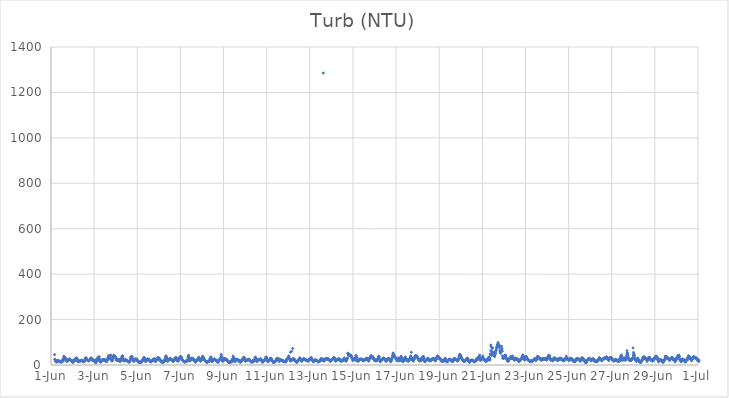
| Category | Turb (NTU) |
|---|---|
| 45078.166666666664 | 45.92 |
| 45078.177083333336 | 25.36 |
| 45078.1875 | 22.28 |
| 45078.197916666664 | 24.57 |
| 45078.208333333336 | 21 |
| 45078.21875 | 15.4 |
| 45078.229166666664 | 14.65 |
| 45078.239583333336 | 13.23 |
| 45078.25 | 13.12 |
| 45078.260416666664 | 14.63 |
| 45078.270833333336 | 14.95 |
| 45078.28125 | 14.61 |
| 45078.291666666664 | 16.44 |
| 45078.302083333336 | 15.64 |
| 45078.3125 | 19.75 |
| 45078.322916666664 | 18.39 |
| 45078.333333333336 | 18.07 |
| 45078.34375 | 18.23 |
| 45078.354166666664 | 17.75 |
| 45078.364583333336 | 17.93 |
| 45078.375 | 17.51 |
| 45078.385416666664 | 15.96 |
| 45078.395833333336 | 16.28 |
| 45078.40625 | 15.74 |
| 45078.416666666664 | 15.92 |
| 45078.427083333336 | 14.31 |
| 45078.4375 | 14.6 |
| 45078.447916666664 | 14.3 |
| 45078.458333333336 | 14.29 |
| 45078.46875 | 13.17 |
| 45078.479166666664 | 13.64 |
| 45078.489583333336 | 13.99 |
| 45078.5 | 13.61 |
| 45078.510416666664 | 15.01 |
| 45078.520833333336 | 15.53 |
| 45078.53125 | 20.23 |
| 45078.541666666664 | 17.02 |
| 45078.552083333336 | 25.13 |
| 45078.5625 | 24.82 |
| 45078.572916666664 | 18.42 |
| 45078.583333333336 | 28.57 |
| 45078.59375 | 38.75 |
| 45078.604166666664 | 30.69 |
| 45078.614583333336 | 33.72 |
| 45078.625 | 34.27 |
| 45078.635416666664 | 32.79 |
| 45078.645833333336 | 31.76 |
| 45078.65625 | 31.31 |
| 45078.666666666664 | 28.81 |
| 45078.677083333336 | 26.71 |
| 45078.6875 | 24.47 |
| 45078.697916666664 | 21.94 |
| 45078.708333333336 | 21.5 |
| 45078.71875 | 18.52 |
| 45078.729166666664 | 15.84 |
| 45078.739583333336 | 23.09 |
| 45078.75 | 18.67 |
| 45078.760416666664 | 18.86 |
| 45078.770833333336 | 18.47 |
| 45078.78125 | 17.57 |
| 45078.791666666664 | 19.25 |
| 45078.802083333336 | 22.15 |
| 45078.8125 | 22.6 |
| 45078.822916666664 | 24.26 |
| 45078.833333333336 | 26.77 |
| 45078.84375 | 26.59 |
| 45078.854166666664 | 25.15 |
| 45078.864583333336 | 24.55 |
| 45078.875 | 23.62 |
| 45078.885416666664 | 22.93 |
| 45078.895833333336 | 22.88 |
| 45078.90625 | 21.23 |
| 45078.916666666664 | 21.32 |
| 45078.927083333336 | 20.01 |
| 45078.9375 | 19.86 |
| 45078.947916666664 | 19.32 |
| 45078.958333333336 | 19.02 |
| 45078.96875 | 19.49 |
| 45078.979166666664 | 17.47 |
| 45078.989583333336 | 13.19 |
| 45079.0 | 12.24 |
| 45079.010416666664 | 11.13 |
| 45079.020833333336 | 14.89 |
| 45079.03125 | 13.81 |
| 45079.041666666664 | 16.24 |
| 45079.052083333336 | 16.71 |
| 45079.0625 | 17.34 |
| 45079.072916666664 | 20.84 |
| 45079.083333333336 | 18.67 |
| 45079.09375 | 23.79 |
| 45079.104166666664 | 26.09 |
| 45079.114583333336 | 24.34 |
| 45079.125 | 26.2 |
| 45079.135416666664 | 23.95 |
| 45079.145833333336 | 20.17 |
| 45079.15625 | 28.8 |
| 45079.166666666664 | 29.65 |
| 45079.177083333336 | 30.25 |
| 45079.1875 | 31.4 |
| 45079.197916666664 | 26.88 |
| 45079.208333333336 | 28.16 |
| 45079.21875 | 23.72 |
| 45079.229166666664 | 21.64 |
| 45079.239583333336 | 16.57 |
| 45079.25 | 14.6 |
| 45079.260416666664 | 14.62 |
| 45079.270833333336 | 14.93 |
| 45079.28125 | 15.76 |
| 45079.291666666664 | 16.23 |
| 45079.302083333336 | 15.79 |
| 45079.3125 | 16.21 |
| 45079.322916666664 | 16.21 |
| 45079.333333333336 | 18.11 |
| 45079.34375 | 17.85 |
| 45079.354166666664 | 18.48 |
| 45079.364583333336 | 18.47 |
| 45079.375 | 18.95 |
| 45079.385416666664 | 20.31 |
| 45079.395833333336 | 19.07 |
| 45079.40625 | 18.91 |
| 45079.416666666664 | 19.46 |
| 45079.427083333336 | 21.25 |
| 45079.4375 | 21.37 |
| 45079.447916666664 | 19.64 |
| 45079.458333333336 | 20.18 |
| 45079.46875 | 19.62 |
| 45079.479166666664 | 17.78 |
| 45079.489583333336 | 15.8 |
| 45079.5 | 14.61 |
| 45079.510416666664 | 14.62 |
| 45079.520833333336 | 15.07 |
| 45079.53125 | 14.79 |
| 45079.541666666664 | 15.48 |
| 45079.552083333336 | 15.75 |
| 45079.5625 | 17.49 |
| 45079.572916666664 | 20.21 |
| 45079.583333333336 | 22.88 |
| 45079.59375 | 30.32 |
| 45079.604166666664 | 26.39 |
| 45079.614583333336 | 26.7 |
| 45079.625 | 32.23 |
| 45079.635416666664 | 27.98 |
| 45079.645833333336 | 26.82 |
| 45079.65625 | 26.56 |
| 45079.666666666664 | 22.85 |
| 45079.677083333336 | 22.76 |
| 45079.6875 | 23.03 |
| 45079.697916666664 | 22.29 |
| 45079.708333333336 | 20.12 |
| 45079.71875 | 18.86 |
| 45079.729166666664 | 19.69 |
| 45079.739583333336 | 17.73 |
| 45079.75 | 19.84 |
| 45079.760416666664 | 18.91 |
| 45079.770833333336 | 20.56 |
| 45079.78125 | 21.21 |
| 45079.791666666664 | 21.92 |
| 45079.802083333336 | 22.75 |
| 45079.8125 | 24.07 |
| 45079.822916666664 | 25.56 |
| 45079.833333333336 | 28.36 |
| 45079.84375 | 29.32 |
| 45079.854166666664 | 31.04 |
| 45079.864583333336 | 31.08 |
| 45079.875 | 25.86 |
| 45079.885416666664 | 25.13 |
| 45079.895833333336 | 22.26 |
| 45079.90625 | 23.39 |
| 45079.916666666664 | 22.83 |
| 45079.927083333336 | 22.66 |
| 45079.9375 | 20.05 |
| 45079.947916666664 | 20.99 |
| 45079.958333333336 | 23.39 |
| 45079.96875 | 19.8 |
| 45079.979166666664 | 19.93 |
| 45079.989583333336 | 19.05 |
| 45080.0 | 18.43 |
| 45080.010416666664 | 18.31 |
| 45080.020833333336 | 17.96 |
| 45080.03125 | 14.26 |
| 45080.041666666664 | 17.46 |
| 45080.052083333336 | 14.63 |
| 45080.0625 | 12.32 |
| 45080.072916666664 | 10.1 |
| 45080.083333333336 | 10.77 |
| 45080.09375 | 19.51 |
| 45080.104166666664 | 23.15 |
| 45080.114583333336 | 23.91 |
| 45080.125 | 27.42 |
| 45080.135416666664 | 20.66 |
| 45080.145833333336 | 21.31 |
| 45080.15625 | 19.14 |
| 45080.166666666664 | 28.66 |
| 45080.177083333336 | 30.06 |
| 45080.1875 | 26.54 |
| 45080.197916666664 | 31.29 |
| 45080.208333333336 | 32.59 |
| 45080.21875 | 35.5 |
| 45080.229166666664 | 36.5 |
| 45080.239583333336 | 30.2 |
| 45080.25 | 24.04 |
| 45080.260416666664 | 22.04 |
| 45080.270833333336 | 17.02 |
| 45080.28125 | 16.66 |
| 45080.291666666664 | 13.56 |
| 45080.302083333336 | 12.36 |
| 45080.3125 | 14.49 |
| 45080.322916666664 | 16.94 |
| 45080.333333333336 | 15.67 |
| 45080.34375 | 16.73 |
| 45080.354166666664 | 18.71 |
| 45080.364583333336 | 18.63 |
| 45080.375 | 21.32 |
| 45080.385416666664 | 23.64 |
| 45080.395833333336 | 21.08 |
| 45080.40625 | 22.82 |
| 45080.416666666664 | 23.3 |
| 45080.427083333336 | 21.32 |
| 45080.4375 | 24.17 |
| 45080.447916666664 | 22.78 |
| 45080.458333333336 | 24.01 |
| 45080.46875 | 22.61 |
| 45080.479166666664 | 23.21 |
| 45080.489583333336 | 23.24 |
| 45080.5 | 22.13 |
| 45080.510416666664 | 19.94 |
| 45080.520833333336 | 20.4 |
| 45080.53125 | 17.2 |
| 45080.541666666664 | 17.31 |
| 45080.552083333336 | 15.77 |
| 45080.5625 | 15.17 |
| 45080.572916666664 | 14.93 |
| 45080.583333333336 | 15.84 |
| 45080.59375 | 18.66 |
| 45080.604166666664 | 21.98 |
| 45080.614583333336 | 21.47 |
| 45080.625 | 26.03 |
| 45080.635416666664 | 27.11 |
| 45080.645833333336 | 32.24 |
| 45080.65625 | 35.81 |
| 45080.666666666664 | 40.18 |
| 45080.677083333336 | 36.61 |
| 45080.6875 | 36.52 |
| 45080.697916666664 | 41.33 |
| 45080.708333333336 | 38.98 |
| 45080.71875 | 40.59 |
| 45080.729166666664 | 37.33 |
| 45080.739583333336 | 33.7 |
| 45080.75 | 29.04 |
| 45080.760416666664 | 26.21 |
| 45080.770833333336 | 30.18 |
| 45080.78125 | 43.48 |
| 45080.791666666664 | 23.07 |
| 45080.802083333336 | 21.36 |
| 45080.8125 | 23.04 |
| 45080.822916666664 | 17.32 |
| 45080.833333333336 | 18.22 |
| 45080.84375 | 19.88 |
| 45080.854166666664 | 20.87 |
| 45080.864583333336 | 25.61 |
| 45080.875 | 32.19 |
| 45080.885416666664 | 38.19 |
| 45080.895833333336 | 37.8 |
| 45080.90625 | 40.72 |
| 45080.916666666664 | 41.71 |
| 45080.927083333336 | 41.16 |
| 45080.9375 | 39.44 |
| 45080.947916666664 | 38.51 |
| 45080.958333333336 | 38.41 |
| 45080.96875 | 35.86 |
| 45080.979166666664 | 34.79 |
| 45080.989583333336 | 34.67 |
| 45081.0 | 31.75 |
| 45081.010416666664 | 30.57 |
| 45081.020833333336 | 27.59 |
| 45081.03125 | 25.03 |
| 45081.041666666664 | 22.01 |
| 45081.052083333336 | 19.84 |
| 45081.0625 | 19.67 |
| 45081.072916666664 | 21.35 |
| 45081.083333333336 | 24.52 |
| 45081.09375 | 22.98 |
| 45081.104166666664 | 21.73 |
| 45081.114583333336 | 22.16 |
| 45081.125 | 20.98 |
| 45081.135416666664 | 20.81 |
| 45081.145833333336 | 19.48 |
| 45081.15625 | 19.38 |
| 45081.166666666664 | 18.02 |
| 45081.177083333336 | 16.49 |
| 45081.1875 | 15.66 |
| 45081.197916666664 | 23.44 |
| 45081.208333333336 | 27.03 |
| 45081.21875 | 24.31 |
| 45081.229166666664 | 24.36 |
| 45081.239583333336 | 17.06 |
| 45081.25 | 27.96 |
| 45081.260416666664 | 24.69 |
| 45081.270833333336 | 22.03 |
| 45081.28125 | 25.79 |
| 45081.291666666664 | 36.8 |
| 45081.302083333336 | 37.72 |
| 45081.3125 | 40.36 |
| 45081.322916666664 | 39.9 |
| 45081.333333333336 | 34.19 |
| 45081.34375 | 27.15 |
| 45081.354166666664 | 24.2 |
| 45081.364583333336 | 20.72 |
| 45081.375 | 18.28 |
| 45081.385416666664 | 18.06 |
| 45081.395833333336 | 19.02 |
| 45081.40625 | 18.68 |
| 45081.416666666664 | 21.26 |
| 45081.427083333336 | 22.22 |
| 45081.4375 | 22.59 |
| 45081.447916666664 | 21.22 |
| 45081.458333333336 | 22.88 |
| 45081.46875 | 22.24 |
| 45081.479166666664 | 21.46 |
| 45081.489583333336 | 21.62 |
| 45081.5 | 19.3 |
| 45081.510416666664 | 19.09 |
| 45081.520833333336 | 19.72 |
| 45081.53125 | 19.68 |
| 45081.541666666664 | 18.55 |
| 45081.552083333336 | 17.98 |
| 45081.5625 | 15.78 |
| 45081.572916666664 | 14.61 |
| 45081.583333333336 | 14.94 |
| 45081.59375 | 14.77 |
| 45081.604166666664 | 14.74 |
| 45081.614583333336 | 13.09 |
| 45081.625 | 12.27 |
| 45081.635416666664 | 14.32 |
| 45081.645833333336 | 19.14 |
| 45081.65625 | 17.9 |
| 45081.666666666664 | 17.14 |
| 45081.677083333336 | 23.47 |
| 45081.6875 | 33.84 |
| 45081.697916666664 | 27.38 |
| 45081.708333333336 | 36.05 |
| 45081.71875 | 32.59 |
| 45081.729166666664 | 29.96 |
| 45081.739583333336 | 37.29 |
| 45081.75 | 37.15 |
| 45081.760416666664 | 34.53 |
| 45081.770833333336 | 30.5 |
| 45081.78125 | 28.59 |
| 45081.791666666664 | 25.18 |
| 45081.802083333336 | 18.37 |
| 45081.8125 | 18.84 |
| 45081.822916666664 | 18.52 |
| 45081.833333333336 | 17.09 |
| 45081.84375 | 15.92 |
| 45081.854166666664 | 18.11 |
| 45081.864583333336 | 19.88 |
| 45081.875 | 22.93 |
| 45081.885416666664 | 21.27 |
| 45081.895833333336 | 24.49 |
| 45081.90625 | 24.25 |
| 45081.916666666664 | 26.84 |
| 45081.927083333336 | 26.17 |
| 45081.9375 | 24.86 |
| 45081.947916666664 | 24.62 |
| 45081.958333333336 | 26.17 |
| 45081.96875 | 25.26 |
| 45081.979166666664 | 21.82 |
| 45081.989583333336 | 22.71 |
| 45082.0 | 21.95 |
| 45082.010416666664 | 19.56 |
| 45082.020833333336 | 19.51 |
| 45082.03125 | 16.52 |
| 45082.041666666664 | 15.99 |
| 45082.052083333336 | 15.04 |
| 45082.0625 | 14.13 |
| 45082.072916666664 | 13.77 |
| 45082.083333333336 | 13.1 |
| 45082.09375 | 12.25 |
| 45082.104166666664 | 11.05 |
| 45082.114583333336 | 11.92 |
| 45082.125 | 11.55 |
| 45082.135416666664 | 11.05 |
| 45082.145833333336 | 10.77 |
| 45082.15625 | 11.22 |
| 45082.166666666664 | 13.2 |
| 45082.177083333336 | 12.93 |
| 45082.1875 | 13.64 |
| 45082.197916666664 | 16.4 |
| 45082.208333333336 | 14.89 |
| 45082.21875 | 18.95 |
| 45082.229166666664 | 15.63 |
| 45082.239583333336 | 17.85 |
| 45082.25 | 21.09 |
| 45082.260416666664 | 23.42 |
| 45082.270833333336 | 26.81 |
| 45082.28125 | 28.07 |
| 45082.291666666664 | 26.38 |
| 45082.302083333336 | 31.04 |
| 45082.3125 | 33.1 |
| 45082.322916666664 | 29.79 |
| 45082.333333333336 | 31.06 |
| 45082.34375 | 26.65 |
| 45082.354166666664 | 22.91 |
| 45082.364583333336 | 19.53 |
| 45082.375 | 15.48 |
| 45082.385416666664 | 16.03 |
| 45082.395833333336 | 17.32 |
| 45082.40625 | 17.9 |
| 45082.416666666664 | 19.14 |
| 45082.427083333336 | 18.99 |
| 45082.4375 | 20.67 |
| 45082.447916666664 | 23.56 |
| 45082.458333333336 | 25.72 |
| 45082.46875 | 24.94 |
| 45082.479166666664 | 25.5 |
| 45082.489583333336 | 25.2 |
| 45082.5 | 25.49 |
| 45082.510416666664 | 22.78 |
| 45082.520833333336 | 24.58 |
| 45082.53125 | 24.31 |
| 45082.541666666664 | 26.2 |
| 45082.552083333336 | 20.39 |
| 45082.5625 | 20.92 |
| 45082.572916666664 | 18.24 |
| 45082.583333333336 | 16.61 |
| 45082.59375 | 17.28 |
| 45082.604166666664 | 14.89 |
| 45082.614583333336 | 15.22 |
| 45082.625 | 15.23 |
| 45082.635416666664 | 13.04 |
| 45082.645833333336 | 14.44 |
| 45082.65625 | 17.63 |
| 45082.666666666664 | 17.74 |
| 45082.677083333336 | 18.18 |
| 45082.6875 | 19.62 |
| 45082.697916666664 | 21.12 |
| 45082.708333333336 | 20.81 |
| 45082.71875 | 20.01 |
| 45082.729166666664 | 19.48 |
| 45082.739583333336 | 23.4 |
| 45082.75 | 23.07 |
| 45082.760416666664 | 24.92 |
| 45082.770833333336 | 26.02 |
| 45082.78125 | 27.28 |
| 45082.791666666664 | 26.86 |
| 45082.802083333336 | 26.06 |
| 45082.8125 | 22.96 |
| 45082.822916666664 | 21.44 |
| 45082.833333333336 | 18.45 |
| 45082.84375 | 16.69 |
| 45082.854166666664 | 14.66 |
| 45082.864583333336 | 18.68 |
| 45082.875 | 19.77 |
| 45082.885416666664 | 22.4 |
| 45082.895833333336 | 21.09 |
| 45082.90625 | 21.84 |
| 45082.916666666664 | 24.81 |
| 45082.927083333336 | 28.85 |
| 45082.9375 | 30.22 |
| 45082.947916666664 | 31.08 |
| 45082.958333333336 | 31.94 |
| 45082.96875 | 32.38 |
| 45082.979166666664 | 30.52 |
| 45082.989583333336 | 31.37 |
| 45083.0 | 29.77 |
| 45083.010416666664 | 30.36 |
| 45083.020833333336 | 26.24 |
| 45083.03125 | 26.25 |
| 45083.041666666664 | 23.23 |
| 45083.052083333336 | 20.88 |
| 45083.0625 | 21.01 |
| 45083.072916666664 | 20.85 |
| 45083.083333333336 | 17.7 |
| 45083.09375 | 18.52 |
| 45083.104166666664 | 16.6 |
| 45083.114583333336 | 16.27 |
| 45083.125 | 15.85 |
| 45083.135416666664 | 13.53 |
| 45083.145833333336 | 12.04 |
| 45083.15625 | 11.56 |
| 45083.166666666664 | 12.38 |
| 45083.177083333336 | 13.33 |
| 45083.1875 | 12.4 |
| 45083.197916666664 | 14.03 |
| 45083.208333333336 | 12.22 |
| 45083.21875 | 12.71 |
| 45083.229166666664 | 16.11 |
| 45083.239583333336 | 19.94 |
| 45083.25 | 18.74 |
| 45083.260416666664 | 23.87 |
| 45083.270833333336 | 19.35 |
| 45083.28125 | 20.6 |
| 45083.291666666664 | 17.88 |
| 45083.302083333336 | 18.5 |
| 45083.3125 | 33.6 |
| 45083.322916666664 | 37 |
| 45083.333333333336 | 40.64 |
| 45083.34375 | 35.44 |
| 45083.354166666664 | 34.06 |
| 45083.364583333336 | 30.74 |
| 45083.375 | 27.79 |
| 45083.385416666664 | 22.51 |
| 45083.395833333336 | 21 |
| 45083.40625 | 16.99 |
| 45083.416666666664 | 16.47 |
| 45083.427083333336 | 18.76 |
| 45083.4375 | 18.98 |
| 45083.447916666664 | 20.31 |
| 45083.458333333336 | 22.65 |
| 45083.46875 | 23.47 |
| 45083.479166666664 | 25.93 |
| 45083.489583333336 | 26.48 |
| 45083.5 | 26.63 |
| 45083.510416666664 | 28.49 |
| 45083.520833333336 | 29.04 |
| 45083.53125 | 27.48 |
| 45083.541666666664 | 26.77 |
| 45083.552083333336 | 26.24 |
| 45083.5625 | 26.74 |
| 45083.572916666664 | 25.39 |
| 45083.583333333336 | 22.41 |
| 45083.59375 | 23 |
| 45083.604166666664 | 22.22 |
| 45083.614583333336 | 19.57 |
| 45083.625 | 20.16 |
| 45083.635416666664 | 18.48 |
| 45083.645833333336 | 17.41 |
| 45083.65625 | 15.37 |
| 45083.666666666664 | 17.37 |
| 45083.677083333336 | 16.09 |
| 45083.6875 | 17.86 |
| 45083.697916666664 | 19.58 |
| 45083.708333333336 | 21.8 |
| 45083.71875 | 26.32 |
| 45083.729166666664 | 23.18 |
| 45083.739583333336 | 22.02 |
| 45083.75 | 28.94 |
| 45083.760416666664 | 31.54 |
| 45083.770833333336 | 30.53 |
| 45083.78125 | 30.13 |
| 45083.791666666664 | 30.72 |
| 45083.802083333336 | 32.23 |
| 45083.8125 | 31.04 |
| 45083.822916666664 | 27.76 |
| 45083.833333333336 | 26 |
| 45083.84375 | 25.32 |
| 45083.854166666664 | 19.79 |
| 45083.864583333336 | 22.5 |
| 45083.875 | 17.01 |
| 45083.885416666664 | 17.35 |
| 45083.895833333336 | 18.45 |
| 45083.90625 | 22.41 |
| 45083.916666666664 | 23.42 |
| 45083.927083333336 | 22.47 |
| 45083.9375 | 25.14 |
| 45083.947916666664 | 29.31 |
| 45083.958333333336 | 29.41 |
| 45083.96875 | 31.66 |
| 45083.979166666664 | 32.54 |
| 45083.989583333336 | 36.06 |
| 45084.0 | 37.14 |
| 45084.010416666664 | 34.3 |
| 45084.020833333336 | 35 |
| 45084.03125 | 35.93 |
| 45084.041666666664 | 33.61 |
| 45084.052083333336 | 30.47 |
| 45084.0625 | 27.24 |
| 45084.072916666664 | 24.83 |
| 45084.083333333336 | 22.06 |
| 45084.09375 | 21.86 |
| 45084.104166666664 | 21.75 |
| 45084.114583333336 | 20.35 |
| 45084.125 | 18.97 |
| 45084.135416666664 | 17.61 |
| 45084.145833333336 | 15.77 |
| 45084.15625 | 15.49 |
| 45084.166666666664 | 15.92 |
| 45084.177083333336 | 13.27 |
| 45084.1875 | 12.9 |
| 45084.197916666664 | 14.42 |
| 45084.208333333336 | 13.62 |
| 45084.21875 | 14.39 |
| 45084.229166666664 | 14.7 |
| 45084.239583333336 | 14.81 |
| 45084.25 | 15.43 |
| 45084.260416666664 | 16.06 |
| 45084.270833333336 | 17.36 |
| 45084.28125 | 20.14 |
| 45084.291666666664 | 17.86 |
| 45084.302083333336 | 20.99 |
| 45084.3125 | 20.41 |
| 45084.322916666664 | 16.26 |
| 45084.333333333336 | 20.37 |
| 45084.34375 | 22.27 |
| 45084.354166666664 | 34.55 |
| 45084.364583333336 | 33.54 |
| 45084.375 | 38.19 |
| 45084.385416666664 | 43.47 |
| 45084.395833333336 | 33.68 |
| 45084.40625 | 27.45 |
| 45084.416666666664 | 21.1 |
| 45084.427083333336 | 20.12 |
| 45084.4375 | 17.59 |
| 45084.447916666664 | 18.75 |
| 45084.458333333336 | 20.71 |
| 45084.46875 | 22.54 |
| 45084.479166666664 | 25.39 |
| 45084.489583333336 | 22.5 |
| 45084.5 | 25.08 |
| 45084.510416666664 | 28.29 |
| 45084.520833333336 | 30.13 |
| 45084.53125 | 25.57 |
| 45084.541666666664 | 30.13 |
| 45084.552083333336 | 29.17 |
| 45084.5625 | 28.09 |
| 45084.572916666664 | 25.64 |
| 45084.583333333336 | 25.84 |
| 45084.59375 | 26.21 |
| 45084.604166666664 | 25.93 |
| 45084.614583333336 | 22.85 |
| 45084.625 | 23.94 |
| 45084.635416666664 | 22.51 |
| 45084.645833333336 | 20.04 |
| 45084.65625 | 20.17 |
| 45084.666666666664 | 16.43 |
| 45084.677083333336 | 14.09 |
| 45084.6875 | 15.07 |
| 45084.697916666664 | 13.8 |
| 45084.708333333336 | 12.75 |
| 45084.71875 | 17.18 |
| 45084.729166666664 | 19.54 |
| 45084.739583333336 | 19.41 |
| 45084.75 | 20.06 |
| 45084.760416666664 | 20.45 |
| 45084.770833333336 | 22.24 |
| 45084.78125 | 23.07 |
| 45084.791666666664 | 21.43 |
| 45084.802083333336 | 22.86 |
| 45084.8125 | 22.61 |
| 45084.822916666664 | 29.21 |
| 45084.833333333336 | 26.89 |
| 45084.84375 | 34.19 |
| 45084.854166666664 | 32.17 |
| 45084.864583333336 | 30.64 |
| 45084.875 | 30.83 |
| 45084.885416666664 | 28.09 |
| 45084.895833333336 | 23.15 |
| 45084.90625 | 20.91 |
| 45084.916666666664 | 22.8 |
| 45084.927083333336 | 17.19 |
| 45084.9375 | 16.67 |
| 45084.947916666664 | 20.37 |
| 45084.958333333336 | 20.2 |
| 45084.96875 | 21.59 |
| 45084.979166666664 | 24.29 |
| 45084.989583333336 | 25.19 |
| 45085.0 | 25.87 |
| 45085.010416666664 | 31.42 |
| 45085.020833333336 | 33.42 |
| 45085.03125 | 38.32 |
| 45085.041666666664 | 34.33 |
| 45085.052083333336 | 35.91 |
| 45085.0625 | 32.39 |
| 45085.072916666664 | 30.31 |
| 45085.083333333336 | 30.86 |
| 45085.09375 | 29.34 |
| 45085.104166666664 | 24.01 |
| 45085.114583333336 | 22.82 |
| 45085.125 | 21.92 |
| 45085.135416666664 | 20.24 |
| 45085.145833333336 | 18.79 |
| 45085.15625 | 18.67 |
| 45085.166666666664 | 17.39 |
| 45085.177083333336 | 16.56 |
| 45085.1875 | 16.3 |
| 45085.197916666664 | 13.47 |
| 45085.208333333336 | 12.09 |
| 45085.21875 | 12.29 |
| 45085.229166666664 | 12.98 |
| 45085.239583333336 | 12.51 |
| 45085.25 | 13.99 |
| 45085.260416666664 | 14.11 |
| 45085.270833333336 | 13.65 |
| 45085.28125 | 14.67 |
| 45085.291666666664 | 15.13 |
| 45085.302083333336 | 16.03 |
| 45085.3125 | 16.72 |
| 45085.322916666664 | 17.02 |
| 45085.333333333336 | 17.67 |
| 45085.34375 | 17.44 |
| 45085.354166666664 | 16.41 |
| 45085.364583333336 | 21.54 |
| 45085.375 | 27.13 |
| 45085.385416666664 | 28.9 |
| 45085.395833333336 | 25.42 |
| 45085.40625 | 32.86 |
| 45085.416666666664 | 36.03 |
| 45085.427083333336 | 29.19 |
| 45085.4375 | 27.18 |
| 45085.447916666664 | 24.71 |
| 45085.458333333336 | 18.47 |
| 45085.46875 | 14.37 |
| 45085.479166666664 | 16.13 |
| 45085.489583333336 | 17.86 |
| 45085.5 | 19.37 |
| 45085.510416666664 | 18.61 |
| 45085.520833333336 | 23.14 |
| 45085.53125 | 23.65 |
| 45085.541666666664 | 24.43 |
| 45085.552083333336 | 24.42 |
| 45085.5625 | 26.83 |
| 45085.572916666664 | 24.7 |
| 45085.583333333336 | 25.57 |
| 45085.59375 | 25.27 |
| 45085.604166666664 | 24.29 |
| 45085.614583333336 | 22.24 |
| 45085.625 | 24.04 |
| 45085.635416666664 | 21.29 |
| 45085.645833333336 | 19.68 |
| 45085.65625 | 21.56 |
| 45085.666666666664 | 20.34 |
| 45085.677083333336 | 20.13 |
| 45085.6875 | 17.13 |
| 45085.697916666664 | 15.85 |
| 45085.708333333336 | 15.68 |
| 45085.71875 | 13.27 |
| 45085.729166666664 | 12.59 |
| 45085.739583333336 | 12.94 |
| 45085.75 | 12.83 |
| 45085.760416666664 | 18.63 |
| 45085.770833333336 | 21.14 |
| 45085.78125 | 20.62 |
| 45085.791666666664 | 21.59 |
| 45085.802083333336 | 21.06 |
| 45085.8125 | 21.29 |
| 45085.822916666664 | 22.54 |
| 45085.833333333336 | 23.35 |
| 45085.84375 | 26.61 |
| 45085.854166666664 | 27.92 |
| 45085.864583333336 | 31.62 |
| 45085.875 | 31.77 |
| 45085.885416666664 | 40.56 |
| 45085.895833333336 | 46.65 |
| 45085.90625 | 36.34 |
| 45085.916666666664 | 33.46 |
| 45085.927083333336 | 33.7 |
| 45085.9375 | 25.57 |
| 45085.947916666664 | 21.31 |
| 45085.958333333336 | 15.89 |
| 45085.96875 | 17.15 |
| 45085.979166666664 | 20.54 |
| 45085.989583333336 | 23.06 |
| 45086.0 | 23.84 |
| 45086.010416666664 | 24.88 |
| 45086.020833333336 | 21.26 |
| 45086.03125 | 28.57 |
| 45086.041666666664 | 23.95 |
| 45086.052083333336 | 25.02 |
| 45086.0625 | 27.61 |
| 45086.072916666664 | 26.21 |
| 45086.083333333336 | 27.33 |
| 45086.09375 | 25.18 |
| 45086.104166666664 | 23.99 |
| 45086.114583333336 | 23.07 |
| 45086.125 | 22.69 |
| 45086.135416666664 | 25.6 |
| 45086.145833333336 | 21.27 |
| 45086.15625 | 21.35 |
| 45086.166666666664 | 22.19 |
| 45086.177083333336 | 19.6 |
| 45086.1875 | 18.51 |
| 45086.197916666664 | 16.77 |
| 45086.208333333336 | 15.5 |
| 45086.21875 | 14.86 |
| 45086.229166666664 | 13.06 |
| 45086.239583333336 | 13.3 |
| 45086.25 | 12.19 |
| 45086.260416666664 | 12.66 |
| 45086.270833333336 | 12.48 |
| 45086.28125 | 12.29 |
| 45086.291666666664 | 12.75 |
| 45086.302083333336 | 12.56 |
| 45086.3125 | 12.9 |
| 45086.322916666664 | 12.9 |
| 45086.333333333336 | 14.72 |
| 45086.34375 | 13.4 |
| 45086.354166666664 | 16.83 |
| 45086.364583333336 | 14.34 |
| 45086.375 | 14.87 |
| 45086.385416666664 | 21.84 |
| 45086.395833333336 | 16.86 |
| 45086.40625 | 26.19 |
| 45086.416666666664 | 25.35 |
| 45086.427083333336 | 17.49 |
| 45086.4375 | 39.67 |
| 45086.447916666664 | 25.89 |
| 45086.458333333336 | 35.29 |
| 45086.46875 | 31.16 |
| 45086.479166666664 | 25.44 |
| 45086.489583333336 | 21.96 |
| 45086.5 | 16.54 |
| 45086.510416666664 | 15.5 |
| 45086.520833333336 | 15.16 |
| 45086.53125 | 19.53 |
| 45086.541666666664 | 20.11 |
| 45086.552083333336 | 18.26 |
| 45086.5625 | 20.22 |
| 45086.572916666664 | 26.47 |
| 45086.583333333336 | 21.79 |
| 45086.59375 | 22.45 |
| 45086.604166666664 | 23.74 |
| 45086.614583333336 | 22.92 |
| 45086.625 | 22.32 |
| 45086.635416666664 | 24.75 |
| 45086.645833333336 | 23.56 |
| 45086.65625 | 21.33 |
| 45086.666666666664 | 21.59 |
| 45086.677083333336 | 22.41 |
| 45086.6875 | 22.16 |
| 45086.697916666664 | 20.8 |
| 45086.708333333336 | 20.72 |
| 45086.71875 | 20.57 |
| 45086.729166666664 | 18.68 |
| 45086.739583333336 | 17.81 |
| 45086.75 | 14.03 |
| 45086.760416666664 | 13.97 |
| 45086.770833333336 | 12.66 |
| 45086.78125 | 14.05 |
| 45086.791666666664 | 13.82 |
| 45086.802083333336 | 15.32 |
| 45086.8125 | 16.38 |
| 45086.822916666664 | 19.48 |
| 45086.833333333336 | 19.77 |
| 45086.84375 | 20.81 |
| 45086.854166666664 | 21.91 |
| 45086.864583333336 | 20.7 |
| 45086.875 | 24.3 |
| 45086.885416666664 | 24.55 |
| 45086.895833333336 | 24.86 |
| 45086.90625 | 31.39 |
| 45086.916666666664 | 30.62 |
| 45086.927083333336 | 30.98 |
| 45086.9375 | 34 |
| 45086.947916666664 | 32.02 |
| 45086.958333333336 | 29.45 |
| 45086.96875 | 30.57 |
| 45086.979166666664 | 22.06 |
| 45086.989583333336 | 20.99 |
| 45087.0 | 17.64 |
| 45087.010416666664 | 17.2 |
| 45087.020833333336 | 17.44 |
| 45087.03125 | 18.87 |
| 45087.041666666664 | 19.49 |
| 45087.052083333336 | 19.59 |
| 45087.0625 | 20.01 |
| 45087.072916666664 | 19.57 |
| 45087.083333333336 | 22.76 |
| 45087.09375 | 19.46 |
| 45087.104166666664 | 22.38 |
| 45087.114583333336 | 23.08 |
| 45087.125 | 22.43 |
| 45087.135416666664 | 22.81 |
| 45087.145833333336 | 23.47 |
| 45087.15625 | 23.55 |
| 45087.166666666664 | 21.65 |
| 45087.177083333336 | 23.9 |
| 45087.1875 | 26.45 |
| 45087.197916666664 | 21.62 |
| 45087.208333333336 | 21.34 |
| 45087.21875 | 20.79 |
| 45087.229166666664 | 20.23 |
| 45087.239583333336 | 19.04 |
| 45087.25 | 18.27 |
| 45087.260416666664 | 15.29 |
| 45087.270833333336 | 15.17 |
| 45087.28125 | 14.38 |
| 45087.291666666664 | 12.48 |
| 45087.302083333336 | 12.19 |
| 45087.3125 | 13.11 |
| 45087.322916666664 | 13.34 |
| 45087.333333333336 | 16.4 |
| 45087.34375 | 14.35 |
| 45087.354166666664 | 18.39 |
| 45087.364583333336 | 16.61 |
| 45087.375 | 15.27 |
| 45087.385416666664 | 16.81 |
| 45087.395833333336 | 20.47 |
| 45087.40625 | 20.95 |
| 45087.416666666664 | 21.46 |
| 45087.427083333336 | 16.6 |
| 45087.4375 | 23.36 |
| 45087.447916666664 | 23.97 |
| 45087.458333333336 | 29.56 |
| 45087.46875 | 31.81 |
| 45087.479166666664 | 34.86 |
| 45087.489583333336 | 30.58 |
| 45087.5 | 28.01 |
| 45087.510416666664 | 24.36 |
| 45087.520833333336 | 22.69 |
| 45087.53125 | 17.9 |
| 45087.541666666664 | 15.37 |
| 45087.552083333336 | 16.36 |
| 45087.5625 | 18.59 |
| 45087.572916666664 | 21.57 |
| 45087.583333333336 | 19.29 |
| 45087.59375 | 21.24 |
| 45087.604166666664 | 21.4 |
| 45087.614583333336 | 24.32 |
| 45087.625 | 24.19 |
| 45087.635416666664 | 23.14 |
| 45087.645833333336 | 24.13 |
| 45087.65625 | 24.24 |
| 45087.666666666664 | 23.63 |
| 45087.677083333336 | 23 |
| 45087.6875 | 23.82 |
| 45087.697916666664 | 24.41 |
| 45087.708333333336 | 27.21 |
| 45087.71875 | 27.55 |
| 45087.729166666664 | 26.03 |
| 45087.739583333336 | 24.06 |
| 45087.75 | 19.86 |
| 45087.760416666664 | 22.16 |
| 45087.770833333336 | 19.92 |
| 45087.78125 | 19.64 |
| 45087.791666666664 | 14.29 |
| 45087.802083333336 | 13.65 |
| 45087.8125 | 12.43 |
| 45087.822916666664 | 14.49 |
| 45087.833333333336 | 13.18 |
| 45087.84375 | 16.26 |
| 45087.854166666664 | 17.83 |
| 45087.864583333336 | 17.94 |
| 45087.875 | 20.15 |
| 45087.885416666664 | 19.35 |
| 45087.895833333336 | 21.18 |
| 45087.90625 | 21.75 |
| 45087.916666666664 | 22.57 |
| 45087.927083333336 | 22.16 |
| 45087.9375 | 23.94 |
| 45087.947916666664 | 26.92 |
| 45087.958333333336 | 33.09 |
| 45087.96875 | 35.14 |
| 45087.979166666664 | 34.25 |
| 45087.989583333336 | 33.18 |
| 45088.0 | 28.05 |
| 45088.010416666664 | 26.3 |
| 45088.020833333336 | 22.2 |
| 45088.03125 | 20.91 |
| 45088.041666666664 | 17.42 |
| 45088.052083333336 | 16.23 |
| 45088.0625 | 15.38 |
| 45088.072916666664 | 16.47 |
| 45088.083333333336 | 16.98 |
| 45088.09375 | 18.07 |
| 45088.104166666664 | 19.95 |
| 45088.114583333336 | 19.02 |
| 45088.125 | 20.32 |
| 45088.135416666664 | 21.65 |
| 45088.145833333336 | 21.62 |
| 45088.15625 | 25.91 |
| 45088.166666666664 | 27.28 |
| 45088.177083333336 | 30.07 |
| 45088.1875 | 27.86 |
| 45088.197916666664 | 28.17 |
| 45088.208333333336 | 26.34 |
| 45088.21875 | 27.66 |
| 45088.229166666664 | 22.15 |
| 45088.239583333336 | 22.6 |
| 45088.25 | 18.48 |
| 45088.260416666664 | 18.88 |
| 45088.270833333336 | 17.63 |
| 45088.28125 | 15.96 |
| 45088.291666666664 | 14.39 |
| 45088.302083333336 | 13.55 |
| 45088.3125 | 10.43 |
| 45088.322916666664 | 11.95 |
| 45088.333333333336 | 12.88 |
| 45088.34375 | 13.77 |
| 45088.354166666664 | 13.96 |
| 45088.364583333336 | 14.13 |
| 45088.375 | 13.89 |
| 45088.385416666664 | 14.06 |
| 45088.395833333336 | 18.1 |
| 45088.40625 | 16.06 |
| 45088.416666666664 | 19.09 |
| 45088.427083333336 | 17.97 |
| 45088.4375 | 20.43 |
| 45088.447916666664 | 25.26 |
| 45088.458333333336 | 19.99 |
| 45088.46875 | 26.6 |
| 45088.479166666664 | 28.78 |
| 45088.489583333336 | 29.85 |
| 45088.5 | 27.28 |
| 45088.510416666664 | 28.63 |
| 45088.520833333336 | 26.34 |
| 45088.53125 | 23.97 |
| 45088.541666666664 | 22.17 |
| 45088.552083333336 | 20.29 |
| 45088.5625 | 19.45 |
| 45088.572916666664 | 17.3 |
| 45088.583333333336 | 15.96 |
| 45088.59375 | 25.81 |
| 45088.604166666664 | 24.97 |
| 45088.614583333336 | 23.04 |
| 45088.625 | 22.09 |
| 45088.635416666664 | 21.31 |
| 45088.645833333336 | 19.6 |
| 45088.65625 | 21.39 |
| 45088.666666666664 | 20.58 |
| 45088.677083333336 | 20.51 |
| 45088.6875 | 20.96 |
| 45088.697916666664 | 22.36 |
| 45088.708333333336 | 19.49 |
| 45088.71875 | 20.44 |
| 45088.729166666664 | 18.35 |
| 45088.739583333336 | 18.35 |
| 45088.75 | 16.62 |
| 45088.760416666664 | 16.95 |
| 45088.770833333336 | 17.39 |
| 45088.78125 | 17.21 |
| 45088.791666666664 | 17.06 |
| 45088.802083333336 | 17.1 |
| 45088.8125 | 15.13 |
| 45088.822916666664 | 15.95 |
| 45088.833333333336 | 15.19 |
| 45088.84375 | 14.43 |
| 45088.854166666664 | 13.91 |
| 45088.864583333336 | 13.15 |
| 45088.875 | 18.5 |
| 45088.885416666664 | 14.25 |
| 45088.895833333336 | 15.01 |
| 45088.90625 | 19.27 |
| 45088.916666666664 | 19.55 |
| 45088.927083333336 | 20.82 |
| 45088.9375 | 27.19 |
| 45088.947916666664 | 24.84 |
| 45088.958333333336 | 26.85 |
| 45088.96875 | 27.44 |
| 45088.979166666664 | 28.42 |
| 45088.989583333336 | 29.93 |
| 45089.0 | 32.58 |
| 45089.010416666664 | 30.54 |
| 45089.020833333336 | 39.92 |
| 45089.03125 | 36.35 |
| 45089.041666666664 | 29.15 |
| 45089.052083333336 | 30.96 |
| 45089.0625 | 25.63 |
| 45089.072916666664 | 25 |
| 45089.083333333336 | 18.92 |
| 45089.09375 | 18.56 |
| 45089.104166666664 | 55.66 |
| 45089.114583333336 | 17.48 |
| 45089.125 | 20.79 |
| 45089.135416666664 | 19.39 |
| 45089.145833333336 | 20.11 |
| 45089.15625 | 60.22 |
| 45089.166666666664 | 20.16 |
| 45089.177083333336 | 23.49 |
| 45089.1875 | 24.52 |
| 45089.197916666664 | 26.24 |
| 45089.208333333336 | 72.9 |
| 45089.21875 | 26.84 |
| 45089.229166666664 | 25.76 |
| 45089.239583333336 | 29.13 |
| 45089.25 | 23.9 |
| 45089.260416666664 | 22.61 |
| 45089.270833333336 | 22.89 |
| 45089.28125 | 25.07 |
| 45089.291666666664 | 24.71 |
| 45089.302083333336 | 21.26 |
| 45089.3125 | 21.22 |
| 45089.322916666664 | 21.03 |
| 45089.333333333336 | 17.21 |
| 45089.34375 | 16.33 |
| 45089.354166666664 | 14.88 |
| 45089.364583333336 | 12.46 |
| 45089.375 | 14.89 |
| 45089.385416666664 | 14.22 |
| 45089.395833333336 | 14.13 |
| 45089.40625 | 12.59 |
| 45089.416666666664 | 12.87 |
| 45089.427083333336 | 16.06 |
| 45089.4375 | 19.45 |
| 45089.447916666664 | 19.45 |
| 45089.458333333336 | 19.15 |
| 45089.46875 | 20.08 |
| 45089.479166666664 | 20.73 |
| 45089.489583333336 | 22.67 |
| 45089.5 | 25.88 |
| 45089.510416666664 | 24.11 |
| 45089.520833333336 | 27.43 |
| 45089.53125 | 30.52 |
| 45089.541666666664 | 31.28 |
| 45089.552083333336 | 26.12 |
| 45089.5625 | 23.42 |
| 45089.572916666664 | 23.18 |
| 45089.583333333336 | 20.03 |
| 45089.59375 | 18.75 |
| 45089.604166666664 | 18.07 |
| 45089.614583333336 | 16.26 |
| 45089.625 | 15.97 |
| 45089.635416666664 | 23.08 |
| 45089.645833333336 | 23.86 |
| 45089.65625 | 21.27 |
| 45089.666666666664 | 20.85 |
| 45089.677083333336 | 24.79 |
| 45089.6875 | 24.26 |
| 45089.697916666664 | 27.2 |
| 45089.708333333336 | 26.37 |
| 45089.71875 | 26.04 |
| 45089.729166666664 | 26.04 |
| 45089.739583333336 | 27.67 |
| 45089.75 | 24.54 |
| 45089.760416666664 | 23.92 |
| 45089.770833333336 | 23.75 |
| 45089.78125 | 23.1 |
| 45089.791666666664 | 23.52 |
| 45089.802083333336 | 23.1 |
| 45089.8125 | 22.52 |
| 45089.822916666664 | 21.32 |
| 45089.833333333336 | 21.51 |
| 45089.84375 | 20.43 |
| 45089.854166666664 | 20.88 |
| 45089.864583333336 | 20.67 |
| 45089.875 | 20.92 |
| 45089.885416666664 | 20.75 |
| 45089.895833333336 | 20.1 |
| 45089.90625 | 16.67 |
| 45089.916666666664 | 19.66 |
| 45089.927083333336 | 17.36 |
| 45089.9375 | 19.95 |
| 45089.947916666664 | 21.46 |
| 45089.958333333336 | 22.15 |
| 45089.96875 | 23.82 |
| 45089.979166666664 | 24.62 |
| 45089.989583333336 | 26.76 |
| 45090.0 | 26.74 |
| 45090.010416666664 | 27.73 |
| 45090.020833333336 | 24.85 |
| 45090.03125 | 26.05 |
| 45090.041666666664 | 26.38 |
| 45090.052083333336 | 31.98 |
| 45090.0625 | 29.54 |
| 45090.072916666664 | 31.85 |
| 45090.083333333336 | 26.91 |
| 45090.09375 | 26 |
| 45090.104166666664 | 24.96 |
| 45090.114583333336 | 23.16 |
| 45090.125 | 22.33 |
| 45090.135416666664 | 19.73 |
| 45090.145833333336 | 17.78 |
| 45090.15625 | 16.3 |
| 45090.166666666664 | 14.73 |
| 45090.177083333336 | 15.5 |
| 45090.1875 | 17.93 |
| 45090.197916666664 | 18.1 |
| 45090.208333333336 | 17.53 |
| 45090.21875 | 18.43 |
| 45090.229166666664 | 20.15 |
| 45090.239583333336 | 19.75 |
| 45090.25 | 23.49 |
| 45090.260416666664 | 23.02 |
| 45090.270833333336 | 18.81 |
| 45090.28125 | 21.17 |
| 45090.291666666664 | 20.16 |
| 45090.302083333336 | 20.27 |
| 45090.3125 | 19.32 |
| 45090.322916666664 | 19.98 |
| 45090.333333333336 | 18.97 |
| 45090.34375 | 19.31 |
| 45090.354166666664 | 18.12 |
| 45090.364583333336 | 17.38 |
| 45090.375 | 17.59 |
| 45090.385416666664 | 15.28 |
| 45090.395833333336 | 12.5 |
| 45090.40625 | 15.45 |
| 45090.416666666664 | 15.44 |
| 45090.427083333336 | 16.01 |
| 45090.4375 | 16.85 |
| 45090.447916666664 | 17.43 |
| 45090.458333333336 | 16.25 |
| 45090.46875 | 16.88 |
| 45090.479166666664 | 19.33 |
| 45090.489583333336 | 18.95 |
| 45090.5 | 20.09 |
| 45090.510416666664 | 28.63 |
| 45090.520833333336 | 25.55 |
| 45090.53125 | 22.34 |
| 45090.541666666664 | 21.23 |
| 45090.552083333336 | 23.87 |
| 45090.5625 | 22.73 |
| 45090.572916666664 | 25.88 |
| 45090.583333333336 | 24.98 |
| 45090.59375 | 25.66 |
| 45090.604166666664 | 26.4 |
| 45090.614583333336 | 23.7 |
| 45090.625 | 1285.67 |
| 45090.635416666664 | 22.27 |
| 45090.645833333336 | 17.99 |
| 45090.65625 | 17.4 |
| 45090.666666666664 | 18.28 |
| 45090.677083333336 | 20.48 |
| 45090.6875 | 23.58 |
| 45090.697916666664 | 21.77 |
| 45090.708333333336 | 23.91 |
| 45090.71875 | 25.62 |
| 45090.729166666664 | 28.31 |
| 45090.739583333336 | 25.98 |
| 45090.75 | 26.34 |
| 45090.760416666664 | 27.37 |
| 45090.770833333336 | 26.45 |
| 45090.78125 | 27.34 |
| 45090.791666666664 | 27.28 |
| 45090.802083333336 | 26.47 |
| 45090.8125 | 25.1 |
| 45090.822916666664 | 26.42 |
| 45090.833333333336 | 26.32 |
| 45090.84375 | 26.17 |
| 45090.854166666664 | 26.38 |
| 45090.864583333336 | 26.27 |
| 45090.875 | 24.97 |
| 45090.885416666664 | 24.13 |
| 45090.895833333336 | 23.07 |
| 45090.90625 | 22.78 |
| 45090.916666666664 | 22.43 |
| 45090.927083333336 | 19.58 |
| 45090.9375 | 17.65 |
| 45090.947916666664 | 16.26 |
| 45090.958333333336 | 19.22 |
| 45090.96875 | 17.14 |
| 45090.979166666664 | 21.3 |
| 45090.989583333336 | 19.02 |
| 45091.0 | 20.89 |
| 45091.010416666664 | 23.75 |
| 45091.020833333336 | 23.85 |
| 45091.03125 | 24.68 |
| 45091.041666666664 | 24.37 |
| 45091.052083333336 | 25.98 |
| 45091.0625 | 26.63 |
| 45091.072916666664 | 27.48 |
| 45091.083333333336 | 28.47 |
| 45091.09375 | 28.25 |
| 45091.104166666664 | 31.78 |
| 45091.114583333336 | 31.78 |
| 45091.125 | 33.05 |
| 45091.135416666664 | 31.49 |
| 45091.145833333336 | 30.38 |
| 45091.15625 | 24.69 |
| 45091.166666666664 | 22.16 |
| 45091.177083333336 | 21.12 |
| 45091.1875 | 16.77 |
| 45091.197916666664 | 18.82 |
| 45091.208333333336 | 18.11 |
| 45091.21875 | 19.9 |
| 45091.229166666664 | 18.79 |
| 45091.239583333336 | 21.09 |
| 45091.25 | 22.42 |
| 45091.260416666664 | 22.04 |
| 45091.270833333336 | 22.79 |
| 45091.28125 | 24.48 |
| 45091.291666666664 | 24.36 |
| 45091.302083333336 | 25.09 |
| 45091.3125 | 27.01 |
| 45091.322916666664 | 26.05 |
| 45091.333333333336 | 24.07 |
| 45091.34375 | 25.9 |
| 45091.354166666664 | 27.45 |
| 45091.364583333336 | 22.1 |
| 45091.375 | 25.11 |
| 45091.385416666664 | 23.09 |
| 45091.395833333336 | 23.55 |
| 45091.40625 | 22.01 |
| 45091.416666666664 | 18.98 |
| 45091.427083333336 | 20.47 |
| 45091.4375 | 21.51 |
| 45091.447916666664 | 16.72 |
| 45091.458333333336 | 15.55 |
| 45091.46875 | 18.11 |
| 45091.479166666664 | 18.94 |
| 45091.489583333336 | 18.92 |
| 45091.5 | 18.46 |
| 45091.510416666664 | 20.95 |
| 45091.520833333336 | 20.82 |
| 45091.53125 | 20.73 |
| 45091.541666666664 | 21.84 |
| 45091.552083333336 | 25.7 |
| 45091.5625 | 21.76 |
| 45091.572916666664 | 21.8 |
| 45091.583333333336 | 23.86 |
| 45091.59375 | 25.53 |
| 45091.604166666664 | 30.67 |
| 45091.614583333336 | 25.92 |
| 45091.625 | 22.4 |
| 45091.635416666664 | 24.11 |
| 45091.645833333336 | 23.1 |
| 45091.65625 | 20.39 |
| 45091.666666666664 | 19.34 |
| 45091.677083333336 | 17.75 |
| 45091.6875 | 16.42 |
| 45091.697916666664 | 19.46 |
| 45091.708333333336 | 23.44 |
| 45091.71875 | 25.99 |
| 45091.729166666664 | 26.41 |
| 45091.739583333336 | 30.86 |
| 45091.75 | 30.56 |
| 45091.760416666664 | 52.12 |
| 45091.770833333336 | 49.17 |
| 45091.78125 | 50.98 |
| 45091.791666666664 | 46.64 |
| 45091.802083333336 | 43.78 |
| 45091.8125 | 43.43 |
| 45091.822916666664 | 47.76 |
| 45091.833333333336 | 45.7 |
| 45091.84375 | 43.24 |
| 45091.854166666664 | 42.66 |
| 45091.864583333336 | 42.24 |
| 45091.875 | 40.75 |
| 45091.885416666664 | 43.27 |
| 45091.895833333336 | 39.41 |
| 45091.90625 | 42.41 |
| 45091.916666666664 | 40.68 |
| 45091.927083333336 | 38.91 |
| 45091.9375 | 36.42 |
| 45091.947916666664 | 33.26 |
| 45091.958333333336 | 28.53 |
| 45091.96875 | 27.68 |
| 45091.979166666664 | 27.23 |
| 45091.989583333336 | 20.03 |
| 45092.0 | 22.95 |
| 45092.010416666664 | 23.88 |
| 45092.020833333336 | 23.11 |
| 45092.03125 | 25.19 |
| 45092.041666666664 | 25.8 |
| 45092.052083333336 | 25.52 |
| 45092.0625 | 29.33 |
| 45092.072916666664 | 28.28 |
| 45092.083333333336 | 24.27 |
| 45092.09375 | 21.53 |
| 45092.104166666664 | 22.39 |
| 45092.114583333336 | 22.91 |
| 45092.125 | 26.99 |
| 45092.135416666664 | 42.6 |
| 45092.145833333336 | 36.04 |
| 45092.15625 | 39.85 |
| 45092.166666666664 | 34.36 |
| 45092.177083333336 | 32.3 |
| 45092.1875 | 27.24 |
| 45092.197916666664 | 23.11 |
| 45092.208333333336 | 20.84 |
| 45092.21875 | 17.47 |
| 45092.229166666664 | 16.34 |
| 45092.239583333336 | 17.38 |
| 45092.25 | 18.62 |
| 45092.260416666664 | 19.07 |
| 45092.270833333336 | 20.95 |
| 45092.28125 | 21.37 |
| 45092.291666666664 | 21.44 |
| 45092.302083333336 | 24.84 |
| 45092.3125 | 25.65 |
| 45092.322916666664 | 25.27 |
| 45092.333333333336 | 25.35 |
| 45092.34375 | 25.8 |
| 45092.354166666664 | 25.39 |
| 45092.364583333336 | 23.54 |
| 45092.375 | 24.96 |
| 45092.385416666664 | 25.04 |
| 45092.395833333336 | 25.86 |
| 45092.40625 | 24.96 |
| 45092.416666666664 | 25.37 |
| 45092.427083333336 | 24.89 |
| 45092.4375 | 23.51 |
| 45092.447916666664 | 24.36 |
| 45092.458333333336 | 23.23 |
| 45092.46875 | 21.26 |
| 45092.479166666664 | 18.45 |
| 45092.489583333336 | 17.31 |
| 45092.5 | 20.26 |
| 45092.510416666664 | 20.23 |
| 45092.520833333336 | 20.02 |
| 45092.53125 | 20.62 |
| 45092.541666666664 | 22.17 |
| 45092.552083333336 | 22.35 |
| 45092.5625 | 24.18 |
| 45092.572916666664 | 23.03 |
| 45092.583333333336 | 25.83 |
| 45092.59375 | 25.69 |
| 45092.604166666664 | 28.83 |
| 45092.614583333336 | 27.6 |
| 45092.625 | 26.23 |
| 45092.635416666664 | 24.33 |
| 45092.645833333336 | 24.39 |
| 45092.65625 | 29.41 |
| 45092.666666666664 | 29.72 |
| 45092.677083333336 | 28.42 |
| 45092.6875 | 29.18 |
| 45092.697916666664 | 22.99 |
| 45092.708333333336 | 20.55 |
| 45092.71875 | 19.39 |
| 45092.729166666664 | 16.86 |
| 45092.739583333336 | 19.49 |
| 45092.75 | 23.98 |
| 45092.760416666664 | 27.47 |
| 45092.770833333336 | 27.78 |
| 45092.78125 | 29.07 |
| 45092.791666666664 | 32.84 |
| 45092.802083333336 | 34.4 |
| 45092.8125 | 37.26 |
| 45092.822916666664 | 37.98 |
| 45092.833333333336 | 41.59 |
| 45092.84375 | 36.57 |
| 45092.854166666664 | 35.64 |
| 45092.864583333336 | 32.41 |
| 45092.875 | 32.91 |
| 45092.885416666664 | 31.01 |
| 45092.895833333336 | 33.24 |
| 45092.90625 | 31.89 |
| 45092.916666666664 | 37.39 |
| 45092.927083333336 | 28.93 |
| 45092.9375 | 31.02 |
| 45092.947916666664 | 28.91 |
| 45092.958333333336 | 29.14 |
| 45092.96875 | 26.47 |
| 45092.979166666664 | 24.61 |
| 45092.989583333336 | 26.2 |
| 45093.0 | 21.6 |
| 45093.010416666664 | 18.27 |
| 45093.020833333336 | 20.71 |
| 45093.03125 | 19.71 |
| 45093.041666666664 | 18.68 |
| 45093.052083333336 | 21.2 |
| 45093.0625 | 20.16 |
| 45093.072916666664 | 21.34 |
| 45093.083333333336 | 18.07 |
| 45093.09375 | 20.57 |
| 45093.104166666664 | 20.58 |
| 45093.114583333336 | 22.14 |
| 45093.125 | 19.9 |
| 45093.135416666664 | 22.06 |
| 45093.145833333336 | 26.03 |
| 45093.15625 | 28.08 |
| 45093.166666666664 | 26.04 |
| 45093.177083333336 | 33.68 |
| 45093.1875 | 36.33 |
| 45093.197916666664 | 38.63 |
| 45093.208333333336 | 36.82 |
| 45093.21875 | 33.25 |
| 45093.229166666664 | 25.88 |
| 45093.239583333336 | 23.01 |
| 45093.25 | 19.66 |
| 45093.260416666664 | 16.55 |
| 45093.270833333336 | 14.27 |
| 45093.28125 | 17.37 |
| 45093.291666666664 | 17.1 |
| 45093.302083333336 | 19.78 |
| 45093.3125 | 20.33 |
| 45093.322916666664 | 20.73 |
| 45093.333333333336 | 21.01 |
| 45093.34375 | 25.62 |
| 45093.354166666664 | 24.03 |
| 45093.364583333336 | 25.41 |
| 45093.375 | 26.68 |
| 45093.385416666664 | 27.01 |
| 45093.395833333336 | 26.39 |
| 45093.40625 | 28.2 |
| 45093.416666666664 | 31.53 |
| 45093.427083333336 | 29.67 |
| 45093.4375 | 26.72 |
| 45093.447916666664 | 29.37 |
| 45093.458333333336 | 26.57 |
| 45093.46875 | 25.45 |
| 45093.479166666664 | 25 |
| 45093.489583333336 | 23.39 |
| 45093.5 | 23 |
| 45093.510416666664 | 20.66 |
| 45093.520833333336 | 17.65 |
| 45093.53125 | 18.57 |
| 45093.541666666664 | 16.46 |
| 45093.552083333336 | 18.08 |
| 45093.5625 | 20.42 |
| 45093.572916666664 | 21.54 |
| 45093.583333333336 | 26.09 |
| 45093.59375 | 24.94 |
| 45093.604166666664 | 25.9 |
| 45093.614583333336 | 26.57 |
| 45093.625 | 24.89 |
| 45093.635416666664 | 26.48 |
| 45093.645833333336 | 28.75 |
| 45093.65625 | 28.15 |
| 45093.666666666664 | 28.28 |
| 45093.677083333336 | 28.96 |
| 45093.6875 | 26.88 |
| 45093.697916666664 | 27.18 |
| 45093.708333333336 | 26.15 |
| 45093.71875 | 23.21 |
| 45093.729166666664 | 22.1 |
| 45093.739583333336 | 14.15 |
| 45093.75 | 19.11 |
| 45093.760416666664 | 16.45 |
| 45093.770833333336 | 17.12 |
| 45093.78125 | 19.67 |
| 45093.791666666664 | 23.91 |
| 45093.802083333336 | 27.48 |
| 45093.8125 | 27.91 |
| 45093.822916666664 | 32.51 |
| 45093.833333333336 | 37.76 |
| 45093.84375 | 42.88 |
| 45093.854166666664 | 48.71 |
| 45093.864583333336 | 53.01 |
| 45093.875 | 49.27 |
| 45093.885416666664 | 46.38 |
| 45093.895833333336 | 45.84 |
| 45093.90625 | 39.89 |
| 45093.916666666664 | 39.58 |
| 45093.927083333336 | 36.82 |
| 45093.9375 | 36.24 |
| 45093.947916666664 | 34.82 |
| 45093.958333333336 | 33.05 |
| 45093.96875 | 31.35 |
| 45093.979166666664 | 29.09 |
| 45093.989583333336 | 28.15 |
| 45094.0 | 27.04 |
| 45094.010416666664 | 29.38 |
| 45094.020833333336 | 26.95 |
| 45094.03125 | 26.88 |
| 45094.041666666664 | 19.88 |
| 45094.052083333336 | 19.92 |
| 45094.0625 | 19.19 |
| 45094.072916666664 | 20.61 |
| 45094.083333333336 | 24.56 |
| 45094.09375 | 28.27 |
| 45094.104166666664 | 30.84 |
| 45094.114583333336 | 21.9 |
| 45094.125 | 25.55 |
| 45094.135416666664 | 19.09 |
| 45094.145833333336 | 18.35 |
| 45094.15625 | 19.78 |
| 45094.166666666664 | 19.29 |
| 45094.177083333336 | 26.9 |
| 45094.1875 | 21.17 |
| 45094.197916666664 | 28.67 |
| 45094.208333333336 | 25.18 |
| 45094.21875 | 29.67 |
| 45094.229166666664 | 37.56 |
| 45094.239583333336 | 38.53 |
| 45094.25 | 30.3 |
| 45094.260416666664 | 29.03 |
| 45094.270833333336 | 24.94 |
| 45094.28125 | 20.95 |
| 45094.291666666664 | 17.07 |
| 45094.302083333336 | 16.63 |
| 45094.3125 | 15.5 |
| 45094.322916666664 | 14.17 |
| 45094.333333333336 | 16.4 |
| 45094.34375 | 18.22 |
| 45094.354166666664 | 18.72 |
| 45094.364583333336 | 19.49 |
| 45094.375 | 21.65 |
| 45094.385416666664 | 26.02 |
| 45094.395833333336 | 29.95 |
| 45094.40625 | 29.64 |
| 45094.416666666664 | 33.36 |
| 45094.427083333336 | 35.03 |
| 45094.4375 | 30.84 |
| 45094.447916666664 | 29.69 |
| 45094.458333333336 | 29.26 |
| 45094.46875 | 25.89 |
| 45094.479166666664 | 24.91 |
| 45094.489583333336 | 24.27 |
| 45094.5 | 21.7 |
| 45094.510416666664 | 19.68 |
| 45094.520833333336 | 20.31 |
| 45094.53125 | 21.16 |
| 45094.541666666664 | 19.93 |
| 45094.552083333336 | 18.55 |
| 45094.5625 | 17.87 |
| 45094.572916666664 | 16.7 |
| 45094.583333333336 | 19.1 |
| 45094.59375 | 20.26 |
| 45094.604166666664 | 24.2 |
| 45094.614583333336 | 24.32 |
| 45094.625 | 25.61 |
| 45094.635416666664 | 26.67 |
| 45094.645833333336 | 25.99 |
| 45094.65625 | 25.31 |
| 45094.666666666664 | 31.32 |
| 45094.677083333336 | 39.21 |
| 45094.6875 | 39.24 |
| 45094.697916666664 | 26.92 |
| 45094.708333333336 | 55.9 |
| 45094.71875 | 31.68 |
| 45094.729166666664 | 30.67 |
| 45094.739583333336 | 28.66 |
| 45094.75 | 23.83 |
| 45094.760416666664 | 25.63 |
| 45094.770833333336 | 20.91 |
| 45094.78125 | 21.7 |
| 45094.791666666664 | 17.2 |
| 45094.802083333336 | 18.4 |
| 45094.8125 | 21.38 |
| 45094.822916666664 | 24.95 |
| 45094.833333333336 | 24.42 |
| 45094.84375 | 26.41 |
| 45094.854166666664 | 32.6 |
| 45094.864583333336 | 33.39 |
| 45094.875 | 33.95 |
| 45094.885416666664 | 38.34 |
| 45094.895833333336 | 41.51 |
| 45094.90625 | 38.54 |
| 45094.916666666664 | 40.5 |
| 45094.927083333336 | 41.37 |
| 45094.9375 | 37.86 |
| 45094.947916666664 | 39.86 |
| 45094.958333333336 | 37.31 |
| 45094.96875 | 35.12 |
| 45094.979166666664 | 34.83 |
| 45094.989583333336 | 33.15 |
| 45095.0 | 33.11 |
| 45095.010416666664 | 30.62 |
| 45095.020833333336 | 28.16 |
| 45095.03125 | 25.14 |
| 45095.041666666664 | 26.97 |
| 45095.052083333336 | 24.25 |
| 45095.0625 | 20.32 |
| 45095.072916666664 | 19.73 |
| 45095.083333333336 | 17.65 |
| 45095.09375 | 18.78 |
| 45095.104166666664 | 18.13 |
| 45095.114583333336 | 19.09 |
| 45095.125 | 19.42 |
| 45095.135416666664 | 20.28 |
| 45095.145833333336 | 23.54 |
| 45095.15625 | 22.99 |
| 45095.166666666664 | 22.31 |
| 45095.177083333336 | 21.29 |
| 45095.1875 | 31.6 |
| 45095.197916666664 | 22.25 |
| 45095.208333333336 | 28.82 |
| 45095.21875 | 24.21 |
| 45095.229166666664 | 28.98 |
| 45095.239583333336 | 28.13 |
| 45095.25 | 35.54 |
| 45095.260416666664 | 37.51 |
| 45095.270833333336 | 37.17 |
| 45095.28125 | 32.16 |
| 45095.291666666664 | 29.8 |
| 45095.302083333336 | 21.43 |
| 45095.3125 | 18.6 |
| 45095.322916666664 | 16.74 |
| 45095.333333333336 | 14.66 |
| 45095.34375 | 14.27 |
| 45095.354166666664 | 17.66 |
| 45095.364583333336 | 17.86 |
| 45095.375 | 18.85 |
| 45095.385416666664 | 19.36 |
| 45095.395833333336 | 18.31 |
| 45095.40625 | 21.86 |
| 45095.416666666664 | 23.41 |
| 45095.427083333336 | 24.35 |
| 45095.4375 | 26.83 |
| 45095.447916666664 | 26.07 |
| 45095.458333333336 | 27.14 |
| 45095.46875 | 28.78 |
| 45095.479166666664 | 30.2 |
| 45095.489583333336 | 27.05 |
| 45095.5 | 26.4 |
| 45095.510416666664 | 23.35 |
| 45095.520833333336 | 20.43 |
| 45095.53125 | 22.35 |
| 45095.541666666664 | 19.57 |
| 45095.552083333336 | 19.1 |
| 45095.5625 | 18.84 |
| 45095.572916666664 | 18.93 |
| 45095.583333333336 | 19.24 |
| 45095.59375 | 20.34 |
| 45095.604166666664 | 17.53 |
| 45095.614583333336 | 19.52 |
| 45095.625 | 24.51 |
| 45095.635416666664 | 23.99 |
| 45095.645833333336 | 24.59 |
| 45095.65625 | 23.96 |
| 45095.666666666664 | 26.35 |
| 45095.677083333336 | 23.61 |
| 45095.6875 | 24.75 |
| 45095.697916666664 | 28.55 |
| 45095.708333333336 | 24.52 |
| 45095.71875 | 28.03 |
| 45095.729166666664 | 27.21 |
| 45095.739583333336 | 26.51 |
| 45095.75 | 25.8 |
| 45095.760416666664 | 27.69 |
| 45095.770833333336 | 24.43 |
| 45095.78125 | 25.07 |
| 45095.791666666664 | 23.81 |
| 45095.802083333336 | 25.27 |
| 45095.8125 | 21.44 |
| 45095.822916666664 | 17.56 |
| 45095.833333333336 | 20.9 |
| 45095.84375 | 23.68 |
| 45095.854166666664 | 24.32 |
| 45095.864583333336 | 31.75 |
| 45095.875 | 27.47 |
| 45095.885416666664 | 29.36 |
| 45095.895833333336 | 32.13 |
| 45095.90625 | 36.3 |
| 45095.916666666664 | 39.36 |
| 45095.927083333336 | 39.6 |
| 45095.9375 | 36.59 |
| 45095.947916666664 | 36.18 |
| 45095.958333333336 | 35.39 |
| 45095.96875 | 32.28 |
| 45095.979166666664 | 32.79 |
| 45095.989583333336 | 29.5 |
| 45096.0 | 29.78 |
| 45096.010416666664 | 30.88 |
| 45096.020833333336 | 28.38 |
| 45096.03125 | 29.31 |
| 45096.041666666664 | 27.49 |
| 45096.052083333336 | 26.24 |
| 45096.0625 | 24.78 |
| 45096.072916666664 | 24.05 |
| 45096.083333333336 | 21.48 |
| 45096.09375 | 20.26 |
| 45096.104166666664 | 16.7 |
| 45096.114583333336 | 16.64 |
| 45096.125 | 17.11 |
| 45096.135416666664 | 18.17 |
| 45096.145833333336 | 17.5 |
| 45096.15625 | 18.46 |
| 45096.166666666664 | 17.69 |
| 45096.177083333336 | 20.16 |
| 45096.1875 | 17.57 |
| 45096.197916666664 | 21.9 |
| 45096.208333333336 | 19.03 |
| 45096.21875 | 18.2 |
| 45096.229166666664 | 16.81 |
| 45096.239583333336 | 24.69 |
| 45096.25 | 23.45 |
| 45096.260416666664 | 25.85 |
| 45096.270833333336 | 26.41 |
| 45096.28125 | 29.9 |
| 45096.291666666664 | 26.18 |
| 45096.302083333336 | 25.9 |
| 45096.3125 | 23.8 |
| 45096.322916666664 | 21.85 |
| 45096.333333333336 | 18.21 |
| 45096.34375 | 15.34 |
| 45096.354166666664 | 14.06 |
| 45096.364583333336 | 13 |
| 45096.375 | 16.42 |
| 45096.385416666664 | 16.19 |
| 45096.395833333336 | 16.47 |
| 45096.40625 | 18.69 |
| 45096.416666666664 | 19.66 |
| 45096.427083333336 | 21.37 |
| 45096.4375 | 21.27 |
| 45096.447916666664 | 23.13 |
| 45096.458333333336 | 24.25 |
| 45096.46875 | 24.93 |
| 45096.479166666664 | 26.32 |
| 45096.489583333336 | 24.3 |
| 45096.5 | 25.56 |
| 45096.510416666664 | 24.01 |
| 45096.520833333336 | 21.55 |
| 45096.53125 | 20.66 |
| 45096.541666666664 | 20.85 |
| 45096.552083333336 | 21.69 |
| 45096.5625 | 20.08 |
| 45096.572916666664 | 20.3 |
| 45096.583333333336 | 18.09 |
| 45096.59375 | 17.74 |
| 45096.604166666664 | 16.44 |
| 45096.614583333336 | 15.4 |
| 45096.625 | 17.47 |
| 45096.635416666664 | 15.32 |
| 45096.645833333336 | 16.91 |
| 45096.65625 | 21.5 |
| 45096.666666666664 | 26.39 |
| 45096.677083333336 | 25.74 |
| 45096.6875 | 26.46 |
| 45096.697916666664 | 24.5 |
| 45096.708333333336 | 24.8 |
| 45096.71875 | 29.37 |
| 45096.729166666664 | 25.87 |
| 45096.739583333336 | 25.9 |
| 45096.75 | 26.73 |
| 45096.760416666664 | 25.46 |
| 45096.770833333336 | 24.39 |
| 45096.78125 | 24.39 |
| 45096.791666666664 | 23.25 |
| 45096.802083333336 | 23.18 |
| 45096.8125 | 21.33 |
| 45096.822916666664 | 20.26 |
| 45096.833333333336 | 21.52 |
| 45096.84375 | 17.34 |
| 45096.854166666664 | 17.84 |
| 45096.864583333336 | 19.4 |
| 45096.875 | 20.91 |
| 45096.885416666664 | 23.46 |
| 45096.895833333336 | 26.21 |
| 45096.90625 | 29.43 |
| 45096.916666666664 | 33.28 |
| 45096.927083333336 | 39.53 |
| 45096.9375 | 42.3 |
| 45096.947916666664 | 47.05 |
| 45096.958333333336 | 46.2 |
| 45096.96875 | 43.54 |
| 45096.979166666664 | 44.26 |
| 45096.989583333336 | 41.06 |
| 45097.0 | 39.72 |
| 45097.010416666664 | 37.68 |
| 45097.020833333336 | 34.7 |
| 45097.03125 | 30.74 |
| 45097.041666666664 | 30.87 |
| 45097.052083333336 | 27.89 |
| 45097.0625 | 25.7 |
| 45097.072916666664 | 24.21 |
| 45097.083333333336 | 23.36 |
| 45097.09375 | 22 |
| 45097.104166666664 | 20.4 |
| 45097.114583333336 | 20.54 |
| 45097.125 | 18.41 |
| 45097.135416666664 | 15.42 |
| 45097.145833333336 | 16.35 |
| 45097.15625 | 17.1 |
| 45097.166666666664 | 16.04 |
| 45097.177083333336 | 17.63 |
| 45097.1875 | 15.92 |
| 45097.197916666664 | 19.57 |
| 45097.208333333336 | 20.42 |
| 45097.21875 | 20.57 |
| 45097.229166666664 | 22.75 |
| 45097.239583333336 | 22.96 |
| 45097.25 | 23.09 |
| 45097.260416666664 | 26.75 |
| 45097.270833333336 | 26.18 |
| 45097.28125 | 27.62 |
| 45097.291666666664 | 26.71 |
| 45097.302083333336 | 30.29 |
| 45097.3125 | 29.63 |
| 45097.322916666664 | 26.73 |
| 45097.333333333336 | 25.72 |
| 45097.34375 | 21.87 |
| 45097.354166666664 | 19.87 |
| 45097.364583333336 | 17.42 |
| 45097.375 | 15.81 |
| 45097.385416666664 | 13.98 |
| 45097.395833333336 | 12.71 |
| 45097.40625 | 13.13 |
| 45097.416666666664 | 13.2 |
| 45097.427083333336 | 16.57 |
| 45097.4375 | 17.83 |
| 45097.447916666664 | 19.57 |
| 45097.458333333336 | 18.39 |
| 45097.46875 | 21.23 |
| 45097.479166666664 | 19.71 |
| 45097.489583333336 | 20.64 |
| 45097.5 | 20.25 |
| 45097.510416666664 | 20.5 |
| 45097.520833333336 | 22.53 |
| 45097.53125 | 19.54 |
| 45097.541666666664 | 19.78 |
| 45097.552083333336 | 18.7 |
| 45097.5625 | 20.43 |
| 45097.572916666664 | 20.57 |
| 45097.583333333336 | 16.83 |
| 45097.59375 | 17.89 |
| 45097.604166666664 | 16.46 |
| 45097.614583333336 | 16.74 |
| 45097.625 | 15.12 |
| 45097.635416666664 | 15.09 |
| 45097.645833333336 | 13.99 |
| 45097.65625 | 15.43 |
| 45097.666666666664 | 17.9 |
| 45097.677083333336 | 17.94 |
| 45097.6875 | 16.04 |
| 45097.697916666664 | 19.48 |
| 45097.708333333336 | 21.24 |
| 45097.71875 | 21.06 |
| 45097.729166666664 | 26.67 |
| 45097.739583333336 | 25.71 |
| 45097.75 | 25.69 |
| 45097.760416666664 | 24.81 |
| 45097.770833333336 | 22.76 |
| 45097.78125 | 28.25 |
| 45097.791666666664 | 31.12 |
| 45097.802083333336 | 31.36 |
| 45097.8125 | 33.24 |
| 45097.822916666664 | 33.27 |
| 45097.833333333336 | 35.57 |
| 45097.84375 | 35.66 |
| 45097.854166666664 | 33.24 |
| 45097.864583333336 | 35.74 |
| 45097.875 | 43.37 |
| 45097.885416666664 | 28.58 |
| 45097.895833333336 | 20.54 |
| 45097.90625 | 23.01 |
| 45097.916666666664 | 22.15 |
| 45097.927083333336 | 21.01 |
| 45097.9375 | 24.56 |
| 45097.947916666664 | 30.95 |
| 45097.958333333336 | 24.25 |
| 45097.96875 | 26.19 |
| 45097.979166666664 | 30.75 |
| 45097.989583333336 | 30.8 |
| 45098.0 | 29.06 |
| 45098.010416666664 | 32.53 |
| 45098.020833333336 | 29.51 |
| 45098.03125 | 40.2 |
| 45098.041666666664 | 30.65 |
| 45098.052083333336 | 24.96 |
| 45098.0625 | 23.83 |
| 45098.072916666664 | 24.68 |
| 45098.083333333336 | 25.12 |
| 45098.09375 | 25.08 |
| 45098.104166666664 | 23.53 |
| 45098.114583333336 | 21.35 |
| 45098.125 | 20.11 |
| 45098.135416666664 | 17.94 |
| 45098.145833333336 | 16.78 |
| 45098.15625 | 16.87 |
| 45098.166666666664 | 16.76 |
| 45098.177083333336 | 15.05 |
| 45098.1875 | 18.12 |
| 45098.197916666664 | 20.22 |
| 45098.208333333336 | 21.69 |
| 45098.21875 | 25.04 |
| 45098.229166666664 | 18.95 |
| 45098.239583333336 | 20.74 |
| 45098.25 | 23.37 |
| 45098.260416666664 | 29 |
| 45098.270833333336 | 28.94 |
| 45098.28125 | 31.24 |
| 45098.291666666664 | 31.49 |
| 45098.302083333336 | 34.71 |
| 45098.3125 | 29.26 |
| 45098.322916666664 | 33.43 |
| 45098.333333333336 | 20.89 |
| 45098.34375 | 26.71 |
| 45098.354166666664 | 25.03 |
| 45098.364583333336 | 49.05 |
| 45098.375 | 45.69 |
| 45098.385416666664 | 63.08 |
| 45098.395833333336 | 88.13 |
| 45098.40625 | 81.72 |
| 45098.416666666664 | 48.1 |
| 45098.427083333336 | 42.27 |
| 45098.4375 | 45.22 |
| 45098.447916666664 | 57.23 |
| 45098.458333333336 | 72.79 |
| 45098.46875 | 76.33 |
| 45098.479166666664 | 57.18 |
| 45098.489583333336 | 52.42 |
| 45098.5 | 42.42 |
| 45098.510416666664 | 51.13 |
| 45098.520833333336 | 52.27 |
| 45098.53125 | 51.85 |
| 45098.541666666664 | 47.64 |
| 45098.552083333336 | 53.91 |
| 45098.5625 | 42.17 |
| 45098.572916666664 | 36.99 |
| 45098.583333333336 | 50.62 |
| 45098.59375 | 46.82 |
| 45098.604166666664 | 49.33 |
| 45098.614583333336 | 57.03 |
| 45098.625 | 63.54 |
| 45098.635416666664 | 64.52 |
| 45098.645833333336 | 65.14 |
| 45098.65625 | 73.34 |
| 45098.666666666664 | 79.08 |
| 45098.677083333336 | 81.55 |
| 45098.6875 | 88.08 |
| 45098.697916666664 | 82.35 |
| 45098.708333333336 | 88.76 |
| 45098.71875 | 93.28 |
| 45098.729166666664 | 98.85 |
| 45098.739583333336 | 87.62 |
| 45098.75 | 90.66 |
| 45098.760416666664 | 85.48 |
| 45098.770833333336 | 86.8 |
| 45098.78125 | 88.15 |
| 45098.791666666664 | 75.14 |
| 45098.802083333336 | 82.36 |
| 45098.8125 | 61.73 |
| 45098.822916666664 | 56.74 |
| 45098.833333333336 | 59.59 |
| 45098.84375 | 51.34 |
| 45098.864583333336 | 65.91 |
| 45098.875 | 68.56 |
| 45098.885416666664 | 60.55 |
| 45098.895833333336 | 81.95 |
| 45098.90625 | 61.3 |
| 45098.916666666664 | 71.81 |
| 45098.927083333336 | 61.49 |
| 45098.9375 | 40.33 |
| 45098.947916666664 | 35.93 |
| 45098.958333333336 | 30.89 |
| 45098.96875 | 28.68 |
| 45098.979166666664 | 29.45 |
| 45098.989583333336 | 31.06 |
| 45099.0 | 29.87 |
| 45099.010416666664 | 33.51 |
| 45099.020833333336 | 34.05 |
| 45099.03125 | 39.65 |
| 45099.041666666664 | 42.54 |
| 45099.052083333336 | 38.3 |
| 45099.0625 | 40.67 |
| 45099.072916666664 | 42.88 |
| 45099.083333333336 | 41.68 |
| 45099.09375 | 38.89 |
| 45099.104166666664 | 31.01 |
| 45099.114583333336 | 28.69 |
| 45099.125 | 27.16 |
| 45099.135416666664 | 25.16 |
| 45099.145833333336 | 22.83 |
| 45099.15625 | 20.97 |
| 45099.166666666664 | 19.02 |
| 45099.177083333336 | 18.56 |
| 45099.1875 | 16.83 |
| 45099.197916666664 | 17.46 |
| 45099.208333333336 | 18.56 |
| 45099.21875 | 19.91 |
| 45099.229166666664 | 21.7 |
| 45099.239583333336 | 24.47 |
| 45099.25 | 26.75 |
| 45099.260416666664 | 29.92 |
| 45099.270833333336 | 30.11 |
| 45099.28125 | 30.45 |
| 45099.291666666664 | 32.11 |
| 45099.302083333336 | 29.28 |
| 45099.3125 | 32.69 |
| 45099.322916666664 | 36.61 |
| 45099.333333333336 | 28.47 |
| 45099.34375 | 37.37 |
| 45099.354166666664 | 31.91 |
| 45099.364583333336 | 35.23 |
| 45099.375 | 27.61 |
| 45099.385416666664 | 30.35 |
| 45099.395833333336 | 38.65 |
| 45099.40625 | 38.46 |
| 45099.416666666664 | 30.45 |
| 45099.427083333336 | 33.45 |
| 45099.4375 | 30.45 |
| 45099.447916666664 | 27.67 |
| 45099.458333333336 | 26.53 |
| 45099.46875 | 24.94 |
| 45099.479166666664 | 23.77 |
| 45099.489583333336 | 19.86 |
| 45099.5 | 24.87 |
| 45099.510416666664 | 25.57 |
| 45099.520833333336 | 27.24 |
| 45099.53125 | 29.11 |
| 45099.541666666664 | 29.3 |
| 45099.552083333336 | 28.69 |
| 45099.5625 | 29.85 |
| 45099.572916666664 | 28.19 |
| 45099.583333333336 | 26.22 |
| 45099.59375 | 25.48 |
| 45099.604166666664 | 24.97 |
| 45099.614583333336 | 24.47 |
| 45099.625 | 24.98 |
| 45099.635416666664 | 25.8 |
| 45099.645833333336 | 22.52 |
| 45099.65625 | 21.6 |
| 45099.666666666664 | 20.65 |
| 45099.677083333336 | 19.61 |
| 45099.6875 | 16.48 |
| 45099.697916666664 | 15.64 |
| 45099.708333333336 | 16.57 |
| 45099.71875 | 16.19 |
| 45099.729166666664 | 21.1 |
| 45099.739583333336 | 18.26 |
| 45099.75 | 22.1 |
| 45099.760416666664 | 23.65 |
| 45099.770833333336 | 23.05 |
| 45099.78125 | 24 |
| 45099.791666666664 | 25.77 |
| 45099.802083333336 | 28.89 |
| 45099.8125 | 25.72 |
| 45099.822916666664 | 28.14 |
| 45099.833333333336 | 29.95 |
| 45099.84375 | 36.96 |
| 45099.854166666664 | 37.11 |
| 45099.864583333336 | 39.37 |
| 45099.875 | 44.03 |
| 45099.885416666664 | 40.94 |
| 45099.895833333336 | 39.3 |
| 45099.90625 | 37.87 |
| 45099.916666666664 | 35.75 |
| 45099.927083333336 | 30.34 |
| 45099.9375 | 27.44 |
| 45099.947916666664 | 25.87 |
| 45099.958333333336 | 23.22 |
| 45099.96875 | 22.21 |
| 45099.979166666664 | 26.83 |
| 45099.989583333336 | 28.36 |
| 45100.0 | 28.7 |
| 45100.010416666664 | 29.03 |
| 45100.020833333336 | 36.04 |
| 45100.03125 | 36.24 |
| 45100.041666666664 | 35.89 |
| 45100.052083333336 | 31.62 |
| 45100.0625 | 31.35 |
| 45100.072916666664 | 29.99 |
| 45100.083333333336 | 27.09 |
| 45100.09375 | 25.87 |
| 45100.104166666664 | 23.33 |
| 45100.114583333336 | 22.79 |
| 45100.125 | 22.05 |
| 45100.135416666664 | 20.56 |
| 45100.145833333336 | 21.32 |
| 45100.15625 | 20.4 |
| 45100.166666666664 | 20.5 |
| 45100.177083333336 | 18.04 |
| 45100.1875 | 16.99 |
| 45100.197916666664 | 17.33 |
| 45100.208333333336 | 15.39 |
| 45100.21875 | 16.3 |
| 45100.229166666664 | 15.25 |
| 45100.239583333336 | 14.74 |
| 45100.25 | 18.11 |
| 45100.260416666664 | 17.31 |
| 45100.270833333336 | 18.03 |
| 45100.28125 | 16.01 |
| 45100.291666666664 | 18.43 |
| 45100.302083333336 | 17.07 |
| 45100.3125 | 17.66 |
| 45100.322916666664 | 18.24 |
| 45100.333333333336 | 18.85 |
| 45100.34375 | 20.58 |
| 45100.354166666664 | 17.81 |
| 45100.364583333336 | 20.88 |
| 45100.375 | 22.82 |
| 45100.385416666664 | 23.39 |
| 45100.395833333336 | 25.87 |
| 45100.40625 | 26.55 |
| 45100.416666666664 | 26.27 |
| 45100.427083333336 | 26.23 |
| 45100.4375 | 27.59 |
| 45100.447916666664 | 27.59 |
| 45100.458333333336 | 25.6 |
| 45100.46875 | 23.22 |
| 45100.479166666664 | 20.81 |
| 45100.489583333336 | 20.18 |
| 45100.5 | 22.25 |
| 45100.510416666664 | 25.63 |
| 45100.520833333336 | 27.58 |
| 45100.53125 | 30.93 |
| 45100.541666666664 | 29.65 |
| 45100.552083333336 | 37.65 |
| 45100.5625 | 36.03 |
| 45100.572916666664 | 33.3 |
| 45100.583333333336 | 32.79 |
| 45100.59375 | 35.82 |
| 45100.604166666664 | 34.75 |
| 45100.614583333336 | 33.22 |
| 45100.625 | 31.2 |
| 45100.635416666664 | 31.1 |
| 45100.645833333336 | 30.28 |
| 45100.65625 | 27.94 |
| 45100.666666666664 | 26.98 |
| 45100.677083333336 | 26.73 |
| 45100.6875 | 25.28 |
| 45100.697916666664 | 25.4 |
| 45100.708333333336 | 24.94 |
| 45100.71875 | 23.33 |
| 45100.729166666664 | 21.97 |
| 45100.739583333336 | 20.98 |
| 45100.75 | 20.72 |
| 45100.760416666664 | 22.9 |
| 45100.770833333336 | 24.01 |
| 45100.78125 | 28.19 |
| 45100.791666666664 | 27.14 |
| 45100.802083333336 | 28.7 |
| 45100.8125 | 29.36 |
| 45100.822916666664 | 26.62 |
| 45100.833333333336 | 24.84 |
| 45100.84375 | 24.67 |
| 45100.854166666664 | 25.5 |
| 45100.864583333336 | 26.66 |
| 45100.875 | 26.82 |
| 45100.885416666664 | 27.85 |
| 45100.895833333336 | 26.57 |
| 45100.90625 | 27 |
| 45100.916666666664 | 26.21 |
| 45100.927083333336 | 28.4 |
| 45100.9375 | 27.17 |
| 45100.947916666664 | 26.59 |
| 45100.958333333336 | 25.39 |
| 45100.96875 | 24.12 |
| 45100.979166666664 | 21.56 |
| 45100.989583333336 | 22.97 |
| 45101.0 | 24.12 |
| 45101.010416666664 | 27.86 |
| 45101.020833333336 | 29.45 |
| 45101.03125 | 31.6 |
| 45101.041666666664 | 35.28 |
| 45101.052083333336 | 35.17 |
| 45101.0625 | 37.86 |
| 45101.072916666664 | 43.17 |
| 45101.083333333336 | 40.76 |
| 45101.09375 | 41.04 |
| 45101.104166666664 | 40.78 |
| 45101.114583333336 | 37.24 |
| 45101.125 | 34.98 |
| 45101.135416666664 | 26.91 |
| 45101.145833333336 | 28.43 |
| 45101.15625 | 24.73 |
| 45101.166666666664 | 21.93 |
| 45101.177083333336 | 25.7 |
| 45101.1875 | 22.7 |
| 45101.197916666664 | 23.34 |
| 45101.208333333336 | 21.93 |
| 45101.21875 | 25.3 |
| 45101.229166666664 | 22.46 |
| 45101.239583333336 | 21.62 |
| 45101.25 | 21.19 |
| 45101.260416666664 | 18.84 |
| 45101.270833333336 | 18.49 |
| 45101.28125 | 19.85 |
| 45101.291666666664 | 23.88 |
| 45101.302083333336 | 23.35 |
| 45101.3125 | 28.98 |
| 45101.322916666664 | 32.23 |
| 45101.333333333336 | 27.9 |
| 45101.34375 | 28.8 |
| 45101.354166666664 | 30.5 |
| 45101.364583333336 | 26.73 |
| 45101.375 | 27.21 |
| 45101.385416666664 | 27.26 |
| 45101.395833333336 | 25.62 |
| 45101.40625 | 25.08 |
| 45101.416666666664 | 23.73 |
| 45101.427083333336 | 26.71 |
| 45101.4375 | 26.21 |
| 45101.447916666664 | 25.99 |
| 45101.458333333336 | 24.29 |
| 45101.46875 | 20.91 |
| 45101.479166666664 | 21.69 |
| 45101.489583333336 | 22.98 |
| 45101.5 | 18.27 |
| 45101.510416666664 | 21.48 |
| 45101.520833333336 | 26.63 |
| 45101.53125 | 22.82 |
| 45101.541666666664 | 25.37 |
| 45101.552083333336 | 24.54 |
| 45101.5625 | 24.67 |
| 45101.572916666664 | 26.29 |
| 45101.583333333336 | 28.25 |
| 45101.59375 | 30.76 |
| 45101.604166666664 | 29.34 |
| 45101.614583333336 | 28.91 |
| 45101.625 | 27.55 |
| 45101.635416666664 | 27.16 |
| 45101.645833333336 | 30.29 |
| 45101.65625 | 23.55 |
| 45101.666666666664 | 24.39 |
| 45101.677083333336 | 27.34 |
| 45101.6875 | 23.23 |
| 45101.697916666664 | 24.62 |
| 45101.708333333336 | 22.61 |
| 45101.71875 | 25.2 |
| 45101.729166666664 | 23.07 |
| 45101.739583333336 | 21.66 |
| 45101.75 | 19.06 |
| 45101.760416666664 | 17.09 |
| 45101.770833333336 | 19.4 |
| 45101.78125 | 20.88 |
| 45101.791666666664 | 19.46 |
| 45101.802083333336 | 22.92 |
| 45101.8125 | 24.7 |
| 45101.822916666664 | 24.46 |
| 45101.833333333336 | 26.8 |
| 45101.84375 | 27.09 |
| 45101.854166666664 | 29.49 |
| 45101.864583333336 | 26.31 |
| 45101.875 | 27.14 |
| 45101.885416666664 | 24.26 |
| 45101.895833333336 | 39.18 |
| 45101.90625 | 29.04 |
| 45101.916666666664 | 28.81 |
| 45101.927083333336 | 27.86 |
| 45101.9375 | 27.52 |
| 45101.947916666664 | 27.93 |
| 45101.958333333336 | 27.22 |
| 45101.96875 | 26.4 |
| 45101.979166666664 | 27.1 |
| 45101.989583333336 | 25.65 |
| 45102.0 | 24.48 |
| 45102.010416666664 | 22.96 |
| 45102.020833333336 | 19 |
| 45102.03125 | 22.81 |
| 45102.041666666664 | 24.25 |
| 45102.052083333336 | 24.54 |
| 45102.0625 | 23.19 |
| 45102.072916666664 | 24 |
| 45102.083333333336 | 26.55 |
| 45102.09375 | 30.21 |
| 45102.104166666664 | 29.81 |
| 45102.114583333336 | 28.86 |
| 45102.125 | 26.77 |
| 45102.135416666664 | 28.22 |
| 45102.145833333336 | 27.48 |
| 45102.15625 | 24.04 |
| 45102.166666666664 | 23.78 |
| 45102.177083333336 | 20.12 |
| 45102.1875 | 25.17 |
| 45102.197916666664 | 18.79 |
| 45102.208333333336 | 20.04 |
| 45102.21875 | 16.27 |
| 45102.229166666664 | 18.15 |
| 45102.239583333336 | 20.05 |
| 45102.25 | 16.54 |
| 45102.260416666664 | 18.72 |
| 45102.270833333336 | 16.21 |
| 45102.28125 | 15.39 |
| 45102.291666666664 | 15.34 |
| 45102.302083333336 | 15.58 |
| 45102.3125 | 17.2 |
| 45102.322916666664 | 19.09 |
| 45102.333333333336 | 20.38 |
| 45102.34375 | 25.68 |
| 45102.354166666664 | 27.46 |
| 45102.364583333336 | 27.19 |
| 45102.375 | 28.14 |
| 45102.385416666664 | 24.58 |
| 45102.395833333336 | 26.05 |
| 45102.40625 | 28.11 |
| 45102.416666666664 | 28.68 |
| 45102.427083333336 | 27.01 |
| 45102.4375 | 23.53 |
| 45102.447916666664 | 23.33 |
| 45102.458333333336 | 26.97 |
| 45102.46875 | 23.01 |
| 45102.479166666664 | 24.73 |
| 45102.489583333336 | 24.07 |
| 45102.5 | 25.06 |
| 45102.510416666664 | 21.42 |
| 45102.520833333336 | 22.67 |
| 45102.53125 | 21.99 |
| 45102.541666666664 | 16.38 |
| 45102.552083333336 | 17.8 |
| 45102.5625 | 27.2 |
| 45102.572916666664 | 24.26 |
| 45102.583333333336 | 25.44 |
| 45102.59375 | 25.84 |
| 45102.604166666664 | 24.39 |
| 45102.614583333336 | 30.82 |
| 45102.625 | 31.39 |
| 45102.635416666664 | 30.76 |
| 45102.645833333336 | 29.6 |
| 45102.65625 | 30.55 |
| 45102.666666666664 | 26.29 |
| 45102.677083333336 | 24.65 |
| 45102.6875 | 23.42 |
| 45102.697916666664 | 22.86 |
| 45102.708333333336 | 20.93 |
| 45102.71875 | 22.72 |
| 45102.729166666664 | 19.79 |
| 45102.739583333336 | 20.76 |
| 45102.75 | 16.22 |
| 45102.760416666664 | 15.1 |
| 45102.770833333336 | 10.94 |
| 45102.78125 | 14.3 |
| 45102.791666666664 | 14.7 |
| 45102.802083333336 | 11.04 |
| 45102.8125 | 10.79 |
| 45102.822916666664 | 12.51 |
| 45102.833333333336 | 11.58 |
| 45102.84375 | 16.37 |
| 45102.854166666664 | 20.26 |
| 45102.864583333336 | 21.76 |
| 45102.875 | 22.05 |
| 45102.885416666664 | 23.53 |
| 45102.895833333336 | 21.71 |
| 45102.90625 | 25.69 |
| 45102.916666666664 | 27.71 |
| 45102.927083333336 | 27.51 |
| 45102.9375 | 28.81 |
| 45102.947916666664 | 28.39 |
| 45102.958333333336 | 28.76 |
| 45102.96875 | 27.63 |
| 45102.979166666664 | 27.77 |
| 45102.989583333336 | 25.44 |
| 45103.0 | 23.81 |
| 45103.010416666664 | 23.01 |
| 45103.020833333336 | 22.32 |
| 45103.03125 | 20.51 |
| 45103.041666666664 | 19.86 |
| 45103.052083333336 | 18.29 |
| 45103.0625 | 23.95 |
| 45103.072916666664 | 22.14 |
| 45103.083333333336 | 22.92 |
| 45103.09375 | 23.4 |
| 45103.104166666664 | 27.88 |
| 45103.114583333336 | 23.87 |
| 45103.125 | 25.99 |
| 45103.135416666664 | 26.07 |
| 45103.145833333336 | 25.43 |
| 45103.15625 | 27.21 |
| 45103.166666666664 | 23.83 |
| 45103.177083333336 | 20.89 |
| 45103.1875 | 22.78 |
| 45103.197916666664 | 20.13 |
| 45103.208333333336 | 19.48 |
| 45103.21875 | 17.26 |
| 45103.229166666664 | 16.34 |
| 45103.239583333336 | 15.63 |
| 45103.25 | 17.74 |
| 45103.260416666664 | 18.3 |
| 45103.270833333336 | 16.26 |
| 45103.28125 | 16.29 |
| 45103.291666666664 | 15.71 |
| 45103.302083333336 | 17.29 |
| 45103.3125 | 14.91 |
| 45103.322916666664 | 17.9 |
| 45103.333333333336 | 16.94 |
| 45103.34375 | 16.94 |
| 45103.354166666664 | 19.3 |
| 45103.364583333336 | 18.39 |
| 45103.375 | 20.71 |
| 45103.385416666664 | 22.88 |
| 45103.395833333336 | 25.52 |
| 45103.40625 | 29.57 |
| 45103.416666666664 | 29.11 |
| 45103.427083333336 | 32.46 |
| 45103.4375 | 29.5 |
| 45103.447916666664 | 30.33 |
| 45103.458333333336 | 28.07 |
| 45103.46875 | 25.51 |
| 45103.479166666664 | 26.15 |
| 45103.489583333336 | 24.59 |
| 45103.5 | 24.06 |
| 45103.510416666664 | 22.22 |
| 45103.520833333336 | 20.93 |
| 45103.53125 | 20.07 |
| 45103.541666666664 | 17.9 |
| 45103.552083333336 | 21.42 |
| 45103.5625 | 24.51 |
| 45103.572916666664 | 25.92 |
| 45103.583333333336 | 24.84 |
| 45103.59375 | 25.95 |
| 45103.604166666664 | 26.18 |
| 45103.614583333336 | 29.49 |
| 45103.625 | 29.19 |
| 45103.635416666664 | 26.19 |
| 45103.645833333336 | 27.8 |
| 45103.65625 | 27.7 |
| 45103.666666666664 | 30.02 |
| 45103.677083333336 | 31.66 |
| 45103.6875 | 31.83 |
| 45103.697916666664 | 31.35 |
| 45103.708333333336 | 30.88 |
| 45103.71875 | 30.17 |
| 45103.729166666664 | 32.41 |
| 45103.739583333336 | 32.86 |
| 45103.75 | 34.35 |
| 45103.760416666664 | 34.27 |
| 45103.770833333336 | 35.75 |
| 45103.78125 | 34.12 |
| 45103.791666666664 | 31.86 |
| 45103.802083333336 | 29.76 |
| 45103.8125 | 25.35 |
| 45103.822916666664 | 24.81 |
| 45103.833333333336 | 22.63 |
| 45103.84375 | 23.32 |
| 45103.854166666664 | 23.84 |
| 45103.864583333336 | 19.73 |
| 45103.875 | 24.09 |
| 45103.885416666664 | 26.57 |
| 45103.895833333336 | 28.82 |
| 45103.90625 | 30.67 |
| 45103.916666666664 | 31.46 |
| 45103.927083333336 | 31.01 |
| 45103.9375 | 33.13 |
| 45103.947916666664 | 31.44 |
| 45103.958333333336 | 31.6 |
| 45103.96875 | 29.78 |
| 45103.979166666664 | 32.64 |
| 45103.989583333336 | 31.73 |
| 45104.0 | 30.29 |
| 45104.010416666664 | 27.64 |
| 45104.020833333336 | 27.08 |
| 45104.03125 | 24.88 |
| 45104.041666666664 | 23 |
| 45104.052083333336 | 22.72 |
| 45104.0625 | 21.95 |
| 45104.072916666664 | 20.27 |
| 45104.083333333336 | 17.89 |
| 45104.09375 | 17.45 |
| 45104.104166666664 | 19.23 |
| 45104.114583333336 | 19.23 |
| 45104.125 | 18.74 |
| 45104.135416666664 | 19.03 |
| 45104.145833333336 | 20.85 |
| 45104.15625 | 21.57 |
| 45104.166666666664 | 23.17 |
| 45104.177083333336 | 22.74 |
| 45104.1875 | 25.7 |
| 45104.197916666664 | 24.41 |
| 45104.208333333336 | 22.82 |
| 45104.21875 | 22.09 |
| 45104.229166666664 | 22.43 |
| 45104.239583333336 | 19.03 |
| 45104.25 | 19.45 |
| 45104.260416666664 | 20.48 |
| 45104.270833333336 | 17.35 |
| 45104.28125 | 17.97 |
| 45104.291666666664 | 15.04 |
| 45104.302083333336 | 17.12 |
| 45104.3125 | 16.2 |
| 45104.322916666664 | 18.4 |
| 45104.333333333336 | 18.83 |
| 45104.34375 | 24.73 |
| 45104.354166666664 | 17.94 |
| 45104.364583333336 | 17.85 |
| 45104.375 | 17.43 |
| 45104.385416666664 | 21.97 |
| 45104.395833333336 | 26.45 |
| 45104.40625 | 32.61 |
| 45104.416666666664 | 38.16 |
| 45104.427083333336 | 40.94 |
| 45104.4375 | 43.84 |
| 45104.447916666664 | 42.35 |
| 45104.458333333336 | 40.72 |
| 45104.46875 | 34.24 |
| 45104.479166666664 | 25.35 |
| 45104.489583333336 | 22.58 |
| 45104.5 | 19.73 |
| 45104.510416666664 | 23.19 |
| 45104.520833333336 | 26.46 |
| 45104.53125 | 26.23 |
| 45104.541666666664 | 26.18 |
| 45104.552083333336 | 24.46 |
| 45104.5625 | 31.27 |
| 45104.572916666664 | 22.4 |
| 45104.583333333336 | 23.17 |
| 45104.59375 | 30.13 |
| 45104.604166666664 | 23.11 |
| 45104.614583333336 | 26.56 |
| 45104.625 | 24.88 |
| 45104.635416666664 | 24.51 |
| 45104.645833333336 | 21.7 |
| 45104.65625 | 22.04 |
| 45104.666666666664 | 28.4 |
| 45104.677083333336 | 33.23 |
| 45104.6875 | 39.88 |
| 45104.697916666664 | 49.09 |
| 45104.708333333336 | 63.08 |
| 45104.71875 | 53.39 |
| 45104.729166666664 | 51.83 |
| 45104.739583333336 | 48.89 |
| 45104.75 | 44.23 |
| 45104.760416666664 | 35.58 |
| 45104.770833333336 | 32.74 |
| 45104.78125 | 28.88 |
| 45104.791666666664 | 26.59 |
| 45104.802083333336 | 23.71 |
| 45104.8125 | 20.85 |
| 45104.822916666664 | 22.19 |
| 45104.833333333336 | 18.84 |
| 45104.84375 | 22.1 |
| 45104.854166666664 | 22.81 |
| 45104.864583333336 | 23.07 |
| 45104.875 | 21.88 |
| 45104.885416666664 | 19.99 |
| 45104.895833333336 | 21.65 |
| 45104.90625 | 20.22 |
| 45104.916666666664 | 21.83 |
| 45104.927083333336 | 22.27 |
| 45104.9375 | 24.6 |
| 45104.947916666664 | 26.38 |
| 45104.958333333336 | 27.82 |
| 45104.96875 | 31.67 |
| 45104.979166666664 | 31.55 |
| 45104.989583333336 | 75.07 |
| 45105.0 | 43.05 |
| 45105.010416666664 | 55.21 |
| 45105.020833333336 | 42.2 |
| 45105.03125 | 49.42 |
| 45105.041666666664 | 43.44 |
| 45105.052083333336 | 42.66 |
| 45105.0625 | 33.25 |
| 45105.072916666664 | 27.71 |
| 45105.083333333336 | 25.72 |
| 45105.09375 | 25.45 |
| 45105.104166666664 | 21.51 |
| 45105.114583333336 | 21.14 |
| 45105.125 | 22.66 |
| 45105.135416666664 | 19.66 |
| 45105.145833333336 | 15.08 |
| 45105.15625 | 19.44 |
| 45105.166666666664 | 21.68 |
| 45105.177083333336 | 22.18 |
| 45105.1875 | 21.59 |
| 45105.197916666664 | 25.33 |
| 45105.208333333336 | 31.24 |
| 45105.21875 | 26.19 |
| 45105.229166666664 | 24.8 |
| 45105.239583333336 | 23.48 |
| 45105.25 | 22.75 |
| 45105.260416666664 | 18.11 |
| 45105.270833333336 | 18.76 |
| 45105.28125 | 14.41 |
| 45105.291666666664 | 13.56 |
| 45105.302083333336 | 16.14 |
| 45105.3125 | 12.6 |
| 45105.322916666664 | 12.76 |
| 45105.333333333336 | 12.82 |
| 45105.34375 | 14.09 |
| 45105.354166666664 | 11.1 |
| 45105.364583333336 | 14.3 |
| 45105.375 | 18.76 |
| 45105.385416666664 | 18.13 |
| 45105.395833333336 | 21.75 |
| 45105.40625 | 19.15 |
| 45105.416666666664 | 21.76 |
| 45105.427083333336 | 23.02 |
| 45105.4375 | 29.68 |
| 45105.447916666664 | 32.46 |
| 45105.458333333336 | 35.42 |
| 45105.46875 | 31.42 |
| 45105.479166666664 | 28.48 |
| 45105.489583333336 | 29.68 |
| 45105.5 | 36 |
| 45105.510416666664 | 34.47 |
| 45105.520833333336 | 35.8 |
| 45105.53125 | 32.41 |
| 45105.541666666664 | 32.16 |
| 45105.552083333336 | 28.95 |
| 45105.5625 | 31.27 |
| 45105.572916666664 | 27.66 |
| 45105.583333333336 | 24.91 |
| 45105.59375 | 24.62 |
| 45105.604166666664 | 23.94 |
| 45105.614583333336 | 24.84 |
| 45105.625 | 23.17 |
| 45105.635416666664 | 21.33 |
| 45105.645833333336 | 15.83 |
| 45105.65625 | 25.71 |
| 45105.666666666664 | 27.01 |
| 45105.677083333336 | 26.34 |
| 45105.6875 | 27.67 |
| 45105.697916666664 | 24.24 |
| 45105.708333333336 | 28.44 |
| 45105.71875 | 33.46 |
| 45105.729166666664 | 33.58 |
| 45105.739583333336 | 32.67 |
| 45105.75 | 32.63 |
| 45105.760416666664 | 33.26 |
| 45105.770833333336 | 27.71 |
| 45105.78125 | 24.67 |
| 45105.791666666664 | 25.42 |
| 45105.802083333336 | 24.96 |
| 45105.8125 | 24.29 |
| 45105.822916666664 | 20.17 |
| 45105.833333333336 | 22.72 |
| 45105.84375 | 23.08 |
| 45105.854166666664 | 19.33 |
| 45105.864583333336 | 20.5 |
| 45105.875 | 20.87 |
| 45105.885416666664 | 17.83 |
| 45105.895833333336 | 17.94 |
| 45105.90625 | 19.34 |
| 45105.916666666664 | 22.62 |
| 45105.927083333336 | 19.52 |
| 45105.9375 | 20.04 |
| 45105.947916666664 | 27.27 |
| 45105.958333333336 | 25.79 |
| 45105.96875 | 25.37 |
| 45105.979166666664 | 30.3 |
| 45105.989583333336 | 31.26 |
| 45106.0 | 33.35 |
| 45106.010416666664 | 33.72 |
| 45106.020833333336 | 31.55 |
| 45106.03125 | 35.69 |
| 45106.041666666664 | 39.02 |
| 45106.052083333336 | 37.56 |
| 45106.0625 | 38.48 |
| 45106.072916666664 | 33.85 |
| 45106.083333333336 | 34.88 |
| 45106.09375 | 36.43 |
| 45106.104166666664 | 32.15 |
| 45106.114583333336 | 32.08 |
| 45106.125 | 26.61 |
| 45106.135416666664 | 23.52 |
| 45106.145833333336 | 21 |
| 45106.15625 | 18.15 |
| 45106.166666666664 | 13.79 |
| 45106.177083333336 | 18.87 |
| 45106.1875 | 20.4 |
| 45106.197916666664 | 21.6 |
| 45106.208333333336 | 19.16 |
| 45106.21875 | 22.82 |
| 45106.229166666664 | 23.45 |
| 45106.239583333336 | 21.81 |
| 45106.25 | 22.74 |
| 45106.260416666664 | 23.69 |
| 45106.270833333336 | 21.01 |
| 45106.28125 | 21.29 |
| 45106.291666666664 | 22.5 |
| 45106.302083333336 | 22.07 |
| 45106.3125 | 18.06 |
| 45106.322916666664 | 18.94 |
| 45106.333333333336 | 15.6 |
| 45106.34375 | 16.57 |
| 45106.354166666664 | 19.39 |
| 45106.364583333336 | 14.99 |
| 45106.375 | 11.01 |
| 45106.385416666664 | 17.89 |
| 45106.395833333336 | 13.12 |
| 45106.40625 | 17.5 |
| 45106.416666666664 | 18.61 |
| 45106.427083333336 | 18 |
| 45106.4375 | 21.13 |
| 45106.447916666664 | 22.27 |
| 45106.458333333336 | 26.15 |
| 45106.46875 | 25.72 |
| 45106.479166666664 | 37.86 |
| 45106.489583333336 | 32.27 |
| 45106.5 | 34.67 |
| 45106.510416666664 | 37.99 |
| 45106.520833333336 | 36.78 |
| 45106.53125 | 35.78 |
| 45106.541666666664 | 33.81 |
| 45106.552083333336 | 36 |
| 45106.5625 | 32.8 |
| 45106.572916666664 | 29.31 |
| 45106.583333333336 | 28.62 |
| 45106.59375 | 31.91 |
| 45106.604166666664 | 28.36 |
| 45106.614583333336 | 27.42 |
| 45106.625 | 26.5 |
| 45106.635416666664 | 26.8 |
| 45106.645833333336 | 26.87 |
| 45106.65625 | 25.6 |
| 45106.666666666664 | 25.06 |
| 45106.677083333336 | 19.83 |
| 45106.6875 | 21.97 |
| 45106.697916666664 | 22.76 |
| 45106.708333333336 | 23.42 |
| 45106.71875 | 26.29 |
| 45106.729166666664 | 29.19 |
| 45106.739583333336 | 28.95 |
| 45106.75 | 28.75 |
| 45106.760416666664 | 29.15 |
| 45106.770833333336 | 30.86 |
| 45106.78125 | 32.45 |
| 45106.791666666664 | 34.09 |
| 45106.802083333336 | 30.95 |
| 45106.8125 | 28.84 |
| 45106.822916666664 | 27.95 |
| 45106.833333333336 | 24.03 |
| 45106.84375 | 27.07 |
| 45106.854166666664 | 26.62 |
| 45106.864583333336 | 24.7 |
| 45106.875 | 27.16 |
| 45106.885416666664 | 23.91 |
| 45106.895833333336 | 25.52 |
| 45106.90625 | 23.52 |
| 45106.916666666664 | 23.16 |
| 45106.927083333336 | 14.4 |
| 45106.9375 | 17.01 |
| 45106.947916666664 | 20.92 |
| 45106.958333333336 | 21.68 |
| 45106.96875 | 21.29 |
| 45106.979166666664 | 18.79 |
| 45106.989583333336 | 26.44 |
| 45107.0 | 27.53 |
| 45107.010416666664 | 31.47 |
| 45107.020833333336 | 28.58 |
| 45107.03125 | 29.14 |
| 45107.041666666664 | 38.28 |
| 45107.052083333336 | 31.95 |
| 45107.0625 | 39.07 |
| 45107.072916666664 | 37.98 |
| 45107.083333333336 | 35.13 |
| 45107.09375 | 39.57 |
| 45107.104166666664 | 43.74 |
| 45107.114583333336 | 42.62 |
| 45107.125 | 39.56 |
| 45107.135416666664 | 36.2 |
| 45107.145833333336 | 28.23 |
| 45107.15625 | 26.29 |
| 45107.166666666664 | 23.68 |
| 45107.177083333336 | 21.63 |
| 45107.1875 | 21 |
| 45107.197916666664 | 19.53 |
| 45107.208333333336 | 14 |
| 45107.21875 | 15.94 |
| 45107.229166666664 | 17.64 |
| 45107.239583333336 | 18.48 |
| 45107.25 | 21.48 |
| 45107.260416666664 | 21.05 |
| 45107.270833333336 | 26.94 |
| 45107.28125 | 24.23 |
| 45107.291666666664 | 24.7 |
| 45107.302083333336 | 22.48 |
| 45107.3125 | 21.63 |
| 45107.322916666664 | 23.33 |
| 45107.333333333336 | 21.87 |
| 45107.34375 | 22.94 |
| 45107.354166666664 | 21.09 |
| 45107.364583333336 | 19.8 |
| 45107.375 | 21.57 |
| 45107.385416666664 | 18.74 |
| 45107.395833333336 | 13.5 |
| 45107.40625 | 18.49 |
| 45107.416666666664 | 13.21 |
| 45107.427083333336 | 15.94 |
| 45107.4375 | 16.05 |
| 45107.447916666664 | 19.15 |
| 45107.458333333336 | 21.77 |
| 45107.46875 | 22.82 |
| 45107.479166666664 | 22.35 |
| 45107.489583333336 | 23.04 |
| 45107.5 | 26.66 |
| 45107.510416666664 | 28.65 |
| 45107.520833333336 | 31.15 |
| 45107.53125 | 24.07 |
| 45107.541666666664 | 34.82 |
| 45107.552083333336 | 34.12 |
| 45107.5625 | 41.19 |
| 45107.572916666664 | 36.55 |
| 45107.583333333336 | 37.74 |
| 45107.59375 | 34.17 |
| 45107.604166666664 | 33.55 |
| 45107.614583333336 | 30.48 |
| 45107.625 | 30.19 |
| 45107.635416666664 | 29.19 |
| 45107.645833333336 | 27.4 |
| 45107.65625 | 26.83 |
| 45107.666666666664 | 30.73 |
| 45107.677083333336 | 28.19 |
| 45107.6875 | 26.23 |
| 45107.697916666664 | 18.39 |
| 45107.708333333336 | 20.53 |
| 45107.71875 | 25.89 |
| 45107.729166666664 | 27.32 |
| 45107.739583333336 | 31.17 |
| 45107.75 | 27.66 |
| 45107.760416666664 | 29.06 |
| 45107.770833333336 | 28.9 |
| 45107.78125 | 32.61 |
| 45107.791666666664 | 37.05 |
| 45107.802083333336 | 35.11 |
| 45107.8125 | 34.82 |
| 45107.822916666664 | 32.11 |
| 45107.833333333336 | 34.61 |
| 45107.84375 | 33.06 |
| 45107.854166666664 | 33.19 |
| 45107.864583333336 | 31.98 |
| 45107.875 | 33.69 |
| 45107.885416666664 | 31.98 |
| 45107.895833333336 | 32.55 |
| 45107.90625 | 31.21 |
| 45107.916666666664 | 28.52 |
| 45107.927083333336 | 27.42 |
| 45107.9375 | 26.98 |
| 45107.947916666664 | 25.79 |
| 45107.958333333336 | 24.26 |
| 45107.96875 | 26.61 |
| 45107.979166666664 | 20.98 |
| 45107.989583333336 | 19.23 |
| 45108.0 | 23.2 |
| 45108.010416666664 | 24.75 |
| 45108.020833333336 | 20.79 |
| 45108.03125 | 15.19 |
| 45108.041666666664 | 19.06 |
| 45108.052083333336 | 29.68 |
| 45108.0625 | 31.52 |
| 45108.072916666664 | 42.23 |
| 45108.083333333336 | 41.22 |
| 45108.09375 | 33.83 |
| 45108.104166666664 | 52.27 |
| 45108.114583333336 | 38.18 |
| 45108.125 | 37.45 |
| 45108.135416666664 | 52.31 |
| 45108.145833333336 | 46 |
| 45108.15625 | 56.43 |
| 45108.166666666664 | 54.03 |
| 45108.177083333336 | 51.28 |
| 45108.1875 | 48.02 |
| 45108.197916666664 | 40.68 |
| 45108.208333333336 | 33.71 |
| 45108.21875 | 25.14 |
| 45108.229166666664 | 23.14 |
| 45108.239583333336 | 23.19 |
| 45108.25 | 19.42 |
| 45108.260416666664 | 18.86 |
| 45108.270833333336 | 21.36 |
| 45108.28125 | 21.18 |
| 45108.291666666664 | 23.68 |
| 45108.302083333336 | 26.74 |
| 45108.3125 | 30.35 |
| 45108.322916666664 | 27.2 |
| 45108.333333333336 | 25.01 |
| 45108.34375 | 23.11 |
| 45108.354166666664 | 26.65 |
| 45108.364583333336 | 26.55 |
| 45108.375 | 22.3 |
| 45108.385416666664 | 23.61 |
| 45108.395833333336 | 24.7 |
| 45108.40625 | 24.37 |
| 45108.416666666664 | 23.03 |
| 45108.427083333336 | 20.27 |
| 45108.4375 | 26.77 |
| 45108.447916666664 | 22.66 |
| 45108.458333333336 | 20.4 |
| 45108.46875 | 18.37 |
| 45108.479166666664 | 25.3 |
| 45108.489583333336 | 22.29 |
| 45108.5 | 25.53 |
| 45108.510416666664 | 21.98 |
| 45108.520833333336 | 37.23 |
| 45108.53125 | 23.29 |
| 45108.541666666664 | 30.43 |
| 45108.552083333336 | 39.17 |
| 45108.5625 | 42.62 |
| 45108.572916666664 | 38.1 |
| 45108.583333333336 | 48.08 |
| 45108.59375 | 41.73 |
| 45108.604166666664 | 45 |
| 45108.614583333336 | 40.51 |
| 45108.625 | 41.36 |
| 45108.635416666664 | 41.14 |
| 45108.645833333336 | 43.7 |
| 45108.65625 | 41.72 |
| 45108.666666666664 | 40.73 |
| 45108.677083333336 | 40.24 |
| 45108.6875 | 37.14 |
| 45108.697916666664 | 32.18 |
| 45108.708333333336 | 29.03 |
| 45108.71875 | 28.68 |
| 45108.729166666664 | 26.32 |
| 45108.739583333336 | 24.74 |
| 45108.75 | 23.22 |
| 45108.760416666664 | 26.55 |
| 45108.770833333336 | 33.91 |
| 45108.78125 | 32.32 |
| 45108.791666666664 | 36.45 |
| 45108.802083333336 | 35.83 |
| 45108.8125 | 44.11 |
| 45108.822916666664 | 51.47 |
| 45108.833333333336 | 46.07 |
| 45108.84375 | 51.05 |
| 45108.854166666664 | 44.93 |
| 45108.864583333336 | 46.97 |
| 45108.875 | 46.36 |
| 45108.885416666664 | 49.7 |
| 45108.895833333336 | 41.07 |
| 45108.90625 | 40.72 |
| 45108.916666666664 | 40.64 |
| 45108.927083333336 | 37.46 |
| 45108.9375 | 35.9 |
| 45108.947916666664 | 34.88 |
| 45108.958333333336 | 32.56 |
| 45108.96875 | 29.15 |
| 45108.979166666664 | 28.89 |
| 45108.989583333336 | 28.6 |
| 45109.0 | 25.49 |
| 45109.010416666664 | 25.34 |
| 45109.020833333336 | 22.31 |
| 45109.03125 | 20.81 |
| 45109.041666666664 | 25.04 |
| 45109.052083333336 | 24.34 |
| 45109.0625 | 25.05 |
| 45109.072916666664 | 27.34 |
| 45109.083333333336 | 29 |
| 45109.09375 | 28.86 |